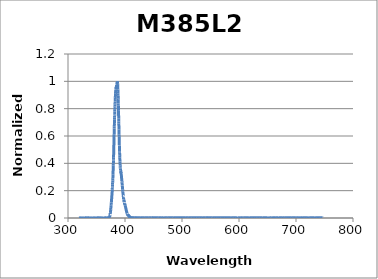
| Category | Normalized Intensity |
|---|---|
| 319.06123499 | 0 |
| 319.17558872 | 0 |
| 319.28993869 | 0 |
| 319.40428493 | 0.001 |
| 319.51862744 | 0 |
| 319.63296621 | 0 |
| 319.74730126 | 0 |
| 319.86163259 | 0 |
| 319.9759602 | 0 |
| 320.09028409 | 0 |
| 320.20460428 | 0 |
| 320.31892077 | 0 |
| 320.43323355 | 0 |
| 320.54754264 | 0 |
| 320.66184804 | 0 |
| 320.77614975 | 0 |
| 320.89044778 | 0 |
| 321.00474213 | 0 |
| 321.11903281 | 0 |
| 321.23331982 | 0 |
| 321.34760317 | 0 |
| 321.46188285 | 0.001 |
| 321.57615889 | 0 |
| 321.69043127 | 0 |
| 321.8047 | 0.001 |
| 321.91896509 | 0.001 |
| 322.03322655 | 0 |
| 322.14748437 | 0 |
| 322.26173856 | 0 |
| 322.37598913 | 0 |
| 322.49023607 | 0 |
| 322.60447941 | 0.001 |
| 322.71871913 | 0 |
| 322.83295524 | 0 |
| 322.94718775 | 0 |
| 323.06141667 | 0 |
| 323.17564199 | 0 |
| 323.28986372 | 0.001 |
| 323.40408187 | 0 |
| 323.51829644 | 0 |
| 323.63250743 | 0 |
| 323.74671485 | 0 |
| 323.8609187 | 0 |
| 323.97511899 | 0 |
| 324.08931573 | 0 |
| 324.20350891 | 0.001 |
| 324.31769854 | 0 |
| 324.43188462 | 0.001 |
| 324.54606717 | 0 |
| 324.66024618 | 0 |
| 324.77442166 | 0 |
| 324.88859361 | 0 |
| 325.00276204 | 0 |
| 325.11692695 | 0.001 |
| 325.23108834 | 0 |
| 325.34524623 | 0.001 |
| 325.45940061 | 0 |
| 325.5735515 | 0 |
| 325.68769888 | 0 |
| 325.80184278 | 0 |
| 325.91598318 | 0 |
| 326.03012011 | 0 |
| 326.14425355 | 0 |
| 326.25838353 | 0 |
| 326.37251003 | 0 |
| 326.48663307 | 0 |
| 326.60075264 | 0 |
| 326.71486877 | 0.001 |
| 326.82898144 | 0.001 |
| 326.94309066 | 0 |
| 327.05719644 | 0 |
| 327.17129878 | 0.001 |
| 327.28539768 | 0 |
| 327.39949316 | 0 |
| 327.51358521 | 0 |
| 327.62767384 | 0 |
| 327.74175906 | 0.001 |
| 327.85584086 | 0.001 |
| 327.96991926 | 0 |
| 328.08399425 | 0 |
| 328.19806584 | 0.001 |
| 328.31213404 | 0.001 |
| 328.42619885 | 0 |
| 328.54026028 | 0 |
| 328.65431832 | 0 |
| 328.76837299 | 0.001 |
| 328.88242428 | 0 |
| 328.99647221 | 0 |
| 329.11051677 | 0 |
| 329.22455798 | 0 |
| 329.33859583 | 0 |
| 329.45263033 | 0 |
| 329.56666148 | 0 |
| 329.6806893 | 0 |
| 329.79471377 | 0 |
| 329.90873492 | 0.001 |
| 330.02275274 | 0 |
| 330.13676723 | 0.001 |
| 330.2507784 | 0.001 |
| 330.36478626 | 0 |
| 330.47879081 | 0 |
| 330.59279206 | 0 |
| 330.70679 | 0 |
| 330.82078465 | 0 |
| 330.934776 | 0 |
| 331.04876407 | 0 |
| 331.16274885 | 0 |
| 331.27673036 | 0 |
| 331.39070858 | 0.001 |
| 331.50468354 | 0.001 |
| 331.61865523 | 0 |
| 331.73262367 | 0.001 |
| 331.84658884 | 0 |
| 331.96055076 | 0 |
| 332.07450943 | 0 |
| 332.18846486 | 0 |
| 332.30241705 | 0 |
| 332.41636601 | 0.001 |
| 332.53031174 | 0 |
| 332.64425423 | 0 |
| 332.75819351 | 0 |
| 332.87212957 | 0 |
| 332.98606242 | 0 |
| 333.09999206 | 0.001 |
| 333.21391849 | 0.001 |
| 333.32784173 | 0.001 |
| 333.44176177 | 0 |
| 333.55567862 | 0 |
| 333.66959229 | 0 |
| 333.78350277 | 0.001 |
| 333.89741007 | 0 |
| 334.0113142 | 0.001 |
| 334.12521517 | 0 |
| 334.23911297 | 0 |
| 334.35300761 | 0 |
| 334.46689909 | 0.001 |
| 334.58078743 | 0 |
| 334.69467261 | 0 |
| 334.80855466 | 0 |
| 334.92243357 | 0 |
| 335.03630934 | 0.001 |
| 335.15018199 | 0.002 |
| 335.26405151 | 0.001 |
| 335.37791791 | 0 |
| 335.4917812 | 0 |
| 335.60564138 | 0 |
| 335.71949845 | 0 |
| 335.83335241 | 0.001 |
| 335.94720328 | 0 |
| 336.06105106 | 0.002 |
| 336.17489575 | 0.001 |
| 336.28873735 | 0.001 |
| 336.40257588 | 0 |
| 336.51641132 | 0 |
| 336.6302437 | 0.001 |
| 336.74407301 | 0.001 |
| 336.85789926 | 0 |
| 336.97172245 | 0.001 |
| 337.08554259 | 0 |
| 337.19935967 | 0 |
| 337.31317372 | 0 |
| 337.42698472 | 0.001 |
| 337.54079269 | 0 |
| 337.65459762 | 0 |
| 337.76839953 | 0.001 |
| 337.88219842 | 0 |
| 337.99599429 | 0 |
| 338.10978714 | 0.001 |
| 338.22357699 | 0.001 |
| 338.33736383 | 0 |
| 338.45114767 | 0 |
| 338.56492852 | 0.001 |
| 338.67870637 | 0 |
| 338.79248124 | 0 |
| 338.90625312 | 0 |
| 339.02002203 | 0 |
| 339.13378796 | 0 |
| 339.24755093 | 0.001 |
| 339.36131093 | 0 |
| 339.47506796 | 0.001 |
| 339.58882205 | 0 |
| 339.70257318 | 0 |
| 339.81632136 | 0 |
| 339.9300666 | 0.001 |
| 340.0438089 | 0 |
| 340.15754827 | 0.001 |
| 340.27128471 | 0 |
| 340.38501822 | 0 |
| 340.49874882 | 0 |
| 340.61247649 | 0.001 |
| 340.72620126 | 0 |
| 340.83992312 | 0.001 |
| 340.95364207 | 0 |
| 341.06735813 | 0 |
| 341.18107129 | 0 |
| 341.29478156 | 0.001 |
| 341.40848895 | 0 |
| 341.52219346 | 0 |
| 341.63589509 | 0 |
| 341.74959385 | 0.001 |
| 341.86328974 | 0 |
| 341.97698277 | 0 |
| 342.09067293 | 0 |
| 342.20436025 | 0 |
| 342.31804472 | 0 |
| 342.43172634 | 0 |
| 342.54540511 | 0 |
| 342.65908106 | 0 |
| 342.77275417 | 0 |
| 342.88642445 | 0 |
| 343.00009191 | 0 |
| 343.11375655 | 0.001 |
| 343.22741838 | 0 |
| 343.34107739 | 0 |
| 343.45473361 | 0 |
| 343.56838701 | 0.001 |
| 343.68203763 | 0 |
| 343.79568545 | 0 |
| 343.90933048 | 0 |
| 344.02297273 | 0 |
| 344.1366122 | 0 |
| 344.2502489 | 0.001 |
| 344.36388283 | 0 |
| 344.47751399 | 0.001 |
| 344.59114238 | 0.001 |
| 344.70476803 | 0.001 |
| 344.81839092 | 0 |
| 344.93201106 | 0.001 |
| 345.04562846 | 0 |
| 345.15924312 | 0 |
| 345.27285504 | 0 |
| 345.38646424 | 0 |
| 345.5000707 | 0.001 |
| 345.61367445 | 0 |
| 345.72727548 | 0 |
| 345.8408738 | 0.001 |
| 345.95446941 | 0 |
| 346.06806231 | 0.001 |
| 346.18165252 | 0 |
| 346.29524003 | 0 |
| 346.40882485 | 0 |
| 346.52240699 | 0 |
| 346.63598644 | 0 |
| 346.74956322 | 0 |
| 346.86313732 | 0 |
| 346.97670876 | 0.001 |
| 347.09027753 | 0 |
| 347.20384364 | 0 |
| 347.31740709 | 0 |
| 347.4309679 | 0 |
| 347.54452606 | 0 |
| 347.65808158 | 0 |
| 347.77163446 | 0 |
| 347.88518471 | 0 |
| 347.99873233 | 0 |
| 348.11227732 | 0.001 |
| 348.2258197 | 0.001 |
| 348.33935946 | 0 |
| 348.45289661 | 0 |
| 348.56643115 | 0 |
| 348.67996309 | 0 |
| 348.79349244 | 0 |
| 348.90701919 | 0 |
| 349.02054335 | 0.001 |
| 349.13406493 | 0 |
| 349.24758393 | 0 |
| 349.36110035 | 0 |
| 349.4746142 | 0.001 |
| 349.58812549 | 0 |
| 349.70163421 | 0 |
| 349.81514038 | 0 |
| 349.92864399 | 0 |
| 350.04214506 | 0 |
| 350.15564358 | 0 |
| 350.26913955 | 0 |
| 350.382633 | 0.001 |
| 350.49612391 | 0 |
| 350.6096123 | 0 |
| 350.72309816 | 0 |
| 350.83658151 | 0.001 |
| 350.95006234 | 0 |
| 351.06354066 | 0 |
| 351.17701648 | 0 |
| 351.2904898 | 0.001 |
| 351.40396063 | 0.001 |
| 351.51742896 | 0 |
| 351.6308948 | 0 |
| 351.74435817 | 0 |
| 351.85781905 | 0 |
| 351.97127746 | 0 |
| 352.08473341 | 0 |
| 352.19818688 | 0 |
| 352.3116379 | 0 |
| 352.42508646 | 0 |
| 352.53853257 | 0.001 |
| 352.65197624 | 0.001 |
| 352.76541746 | 0 |
| 352.87885624 | 0 |
| 352.99229259 | 0.001 |
| 353.10572651 | 0.001 |
| 353.219158 | 0 |
| 353.33258707 | 0 |
| 353.44601373 | 0 |
| 353.55943798 | 0.001 |
| 353.67285982 | 0 |
| 353.78627925 | 0.001 |
| 353.89969629 | 0 |
| 354.01311094 | 0.001 |
| 354.12652319 | 0 |
| 354.23993306 | 0 |
| 354.35334055 | 0 |
| 354.46674566 | 0.001 |
| 354.58014841 | 0 |
| 354.69354878 | 0 |
| 354.80694679 | 0 |
| 354.92034244 | 0 |
| 355.03373574 | 0 |
| 355.14712669 | 0.001 |
| 355.26051529 | 0 |
| 355.37390156 | 0.001 |
| 355.48728548 | 0 |
| 355.60066708 | 0.001 |
| 355.71404635 | 0 |
| 355.82742329 | 0.001 |
| 355.94079791 | 0 |
| 356.05417023 | 0.001 |
| 356.16754023 | 0 |
| 356.28090792 | 0.001 |
| 356.39427332 | 0 |
| 356.50763642 | 0.001 |
| 356.62099722 | 0.001 |
| 356.73435574 | 0.001 |
| 356.84771198 | 0 |
| 356.96106594 | 0.002 |
| 357.07441762 | 0 |
| 357.18776703 | 0 |
| 357.30111418 | 0 |
| 357.41445906 | 0.001 |
| 357.52780169 | 0 |
| 357.64114207 | 0 |
| 357.7544802 | 0 |
| 357.86781609 | 0.001 |
| 357.98114973 | 0 |
| 358.09448114 | 0 |
| 358.20781033 | 0.001 |
| 358.32113728 | 0 |
| 358.43446202 | 0 |
| 358.54778454 | 0.001 |
| 358.66110484 | 0 |
| 358.77442294 | 0 |
| 358.88773884 | 0 |
| 359.00105253 | 0.001 |
| 359.11436403 | 0 |
| 359.22767334 | 0.001 |
| 359.34098047 | 0 |
| 359.45428541 | 0 |
| 359.56758818 | 0 |
| 359.68088877 | 0.001 |
| 359.79418719 | 0 |
| 359.90748346 | 0 |
| 360.02077756 | 0 |
| 360.13406951 | 0 |
| 360.2473593 | 0 |
| 360.36064695 | 0 |
| 360.47393246 | 0 |
| 360.58721584 | 0 |
| 360.70049708 | 0 |
| 360.81377619 | 0 |
| 360.92705317 | 0 |
| 361.04032804 | 0 |
| 361.1536008 | 0 |
| 361.26687144 | 0.001 |
| 361.38013997 | 0 |
| 361.49340641 | 0 |
| 361.60667075 | 0 |
| 361.71993299 | 0.001 |
| 361.83319314 | 0 |
| 361.94645122 | 0 |
| 362.05970721 | 0 |
| 362.17296113 | 0.001 |
| 362.28621297 | 0 |
| 362.39946275 | 0.001 |
| 362.51271047 | 0.001 |
| 362.62595613 | 0 |
| 362.73919974 | 0 |
| 362.85244129 | 0 |
| 362.96568081 | 0.001 |
| 363.07891828 | 0.001 |
| 363.19215372 | 0 |
| 363.30538713 | 0 |
| 363.41861851 | 0 |
| 363.53184787 | 0.001 |
| 363.64507521 | 0 |
| 363.75830054 | 0 |
| 363.87152386 | 0 |
| 363.98474518 | 0 |
| 364.09796449 | 0 |
| 364.21118182 | 0 |
| 364.32439714 | 0 |
| 364.43761049 | 0 |
| 364.55082185 | 0.001 |
| 364.66403123 | 0.001 |
| 364.77723864 | 0 |
| 364.89044408 | 0.001 |
| 365.00364755 | 0 |
| 365.11684907 | 0 |
| 365.23004863 | 0 |
| 365.34324624 | 0.002 |
| 365.4564419 | 0 |
| 365.56963562 | 0 |
| 365.6828274 | 0 |
| 365.79601725 | 0.001 |
| 365.90920516 | 0 |
| 366.02239116 | 0.001 |
| 366.13557523 | 0 |
| 366.24875739 | 0 |
| 366.36193764 | 0 |
| 366.47511598 | 0 |
| 366.58829241 | 0 |
| 366.70146695 | 0.001 |
| 366.8146396 | 0 |
| 366.92781035 | 0 |
| 367.04097922 | 0.001 |
| 367.15414621 | 0 |
| 367.26731133 | 0 |
| 367.38047457 | 0.001 |
| 367.49363594 | 0 |
| 367.60679546 | 0 |
| 367.71995311 | 0 |
| 367.83310891 | 0 |
| 367.94626286 | 0 |
| 368.05941497 | 0.001 |
| 368.17256523 | 0 |
| 368.28571366 | 0.001 |
| 368.39886026 | 0 |
| 368.51200503 | 0.001 |
| 368.62514798 | 0 |
| 368.73828911 | 0.001 |
| 368.85142842 | 0.001 |
| 368.96456593 | 0.002 |
| 369.07770163 | 0.001 |
| 369.19083553 | 0 |
| 369.30396763 | 0.001 |
| 369.41709794 | 0 |
| 369.53022646 | 0 |
| 369.6433532 | 0.001 |
| 369.75647817 | 0.001 |
| 369.86960135 | 0.001 |
| 369.98272277 | 0.001 |
| 370.09584242 | 0.001 |
| 370.20896031 | 0 |
| 370.32207645 | 0.002 |
| 370.43519083 | 0.001 |
| 370.54830347 | 0.002 |
| 370.66141436 | 0.002 |
| 370.77452351 | 0.002 |
| 370.88763093 | 0.002 |
| 371.00073662 | 0.001 |
| 371.11384058 | 0.002 |
| 371.22694283 | 0.002 |
| 371.34004335 | 0.002 |
| 371.45314216 | 0.003 |
| 371.56623927 | 0.002 |
| 371.67933467 | 0.003 |
| 371.79242838 | 0.003 |
| 371.90552038 | 0.004 |
| 372.0186107 | 0.004 |
| 372.13169934 | 0.004 |
| 372.24478629 | 0.005 |
| 372.35787156 | 0.006 |
| 372.47095516 | 0.007 |
| 372.5840371 | 0.007 |
| 372.69711737 | 0.008 |
| 372.81019598 | 0.009 |
| 372.92327294 | 0.008 |
| 373.03634824 | 0.012 |
| 373.14942191 | 0.011 |
| 373.26249392 | 0.014 |
| 373.37556431 | 0.014 |
| 373.48863306 | 0.018 |
| 373.60170018 | 0.02 |
| 373.71476568 | 0.021 |
| 373.82782956 | 0.024 |
| 373.94089182 | 0.029 |
| 374.05395247 | 0.029 |
| 374.16701152 | 0.036 |
| 374.28006897 | 0.038 |
| 374.39312481 | 0.041 |
| 374.50617907 | 0.043 |
| 374.61923174 | 0.05 |
| 374.73228282 | 0.053 |
| 374.84533233 | 0.056 |
| 374.95838025 | 0.062 |
| 375.07142661 | 0.065 |
| 375.18447141 | 0.074 |
| 375.29751464 | 0.078 |
| 375.41055631 | 0.084 |
| 375.52359643 | 0.093 |
| 375.636635 | 0.094 |
| 375.74967203 | 0.099 |
| 375.86270752 | 0.101 |
| 375.97574147 | 0.112 |
| 376.08877389 | 0.117 |
| 376.20180479 | 0.123 |
| 376.31483416 | 0.127 |
| 376.42786202 | 0.134 |
| 376.54088836 | 0.14 |
| 376.6539132 | 0.144 |
| 376.76693653 | 0.15 |
| 376.87995836 | 0.157 |
| 376.9929787 | 0.165 |
| 377.10599754 | 0.169 |
| 377.2190149 | 0.178 |
| 377.33203077 | 0.183 |
| 377.44504517 | 0.191 |
| 377.5580581 | 0.198 |
| 377.67106955 | 0.21 |
| 377.78407955 | 0.213 |
| 377.89708808 | 0.223 |
| 378.01009516 | 0.23 |
| 378.12310078 | 0.243 |
| 378.23610496 | 0.256 |
| 378.3491077 | 0.262 |
| 378.46210899 | 0.274 |
| 378.57510886 | 0.279 |
| 378.6881073 | 0.291 |
| 378.80110431 | 0.3 |
| 378.9140999 | 0.316 |
| 379.02709408 | 0.329 |
| 379.14008684 | 0.342 |
| 379.2530782 | 0.356 |
| 379.36606815 | 0.366 |
| 379.47905671 | 0.386 |
| 379.59204388 | 0.399 |
| 379.70502965 | 0.421 |
| 379.81801404 | 0.43 |
| 379.93099705 | 0.445 |
| 380.04397868 | 0.462 |
| 380.15695895 | 0.481 |
| 380.26993784 | 0.497 |
| 380.38291538 | 0.514 |
| 380.49589155 | 0.535 |
| 380.60886637 | 0.557 |
| 380.72183984 | 0.578 |
| 380.83481197 | 0.592 |
| 380.94778276 | 0.614 |
| 381.06075221 | 0.632 |
| 381.17372033 | 0.655 |
| 381.28668712 | 0.668 |
| 381.39965259 | 0.687 |
| 381.51261674 | 0.694 |
| 381.62557958 | 0.719 |
| 381.7385411 | 0.733 |
| 381.85150133 | 0.751 |
| 381.96446025 | 0.758 |
| 382.07741787 | 0.779 |
| 382.19037421 | 0.793 |
| 382.30332925 | 0.811 |
| 382.41628302 | 0.816 |
| 382.5292355 | 0.832 |
| 382.64218671 | 0.84 |
| 382.75513666 | 0.852 |
| 382.86808533 | 0.87 |
| 382.98103275 | 0.879 |
| 383.09397891 | 0.888 |
| 383.20692381 | 0.9 |
| 383.31986747 | 0.907 |
| 383.43280989 | 0.908 |
| 383.54575107 | 0.919 |
| 383.65869101 | 0.915 |
| 383.77162973 | 0.931 |
| 383.88456722 | 0.928 |
| 383.99750348 | 0.937 |
| 384.11043854 | 0.938 |
| 384.22337237 | 0.941 |
| 384.33630501 | 0.953 |
| 384.44923643 | 0.955 |
| 384.56216666 | 0.959 |
| 384.6750957 | 0.948 |
| 384.78802354 | 0.959 |
| 384.9009502 | 0.958 |
| 385.01387568 | 0.961 |
| 385.12679999 | 0.964 |
| 385.23972311 | 0.968 |
| 385.35264508 | 0.97 |
| 385.46556588 | 0.971 |
| 385.57848551 | 0.965 |
| 385.691404 | 0.975 |
| 385.80432133 | 0.976 |
| 385.91723752 | 0.977 |
| 386.03015257 | 0.983 |
| 386.14306648 | 0.989 |
| 386.25597926 | 0.988 |
| 386.36889091 | 0.995 |
| 386.48180144 | 0.992 |
| 386.59471085 | 0.998 |
| 386.70761914 | 1 |
| 386.82052633 | 0.988 |
| 386.9334324 | 0.986 |
| 387.04633738 | 0.985 |
| 387.15924126 | 0.978 |
| 387.27214404 | 0.971 |
| 387.38504574 | 0.966 |
| 387.49794636 | 0.944 |
| 387.61084589 | 0.94 |
| 387.72374435 | 0.928 |
| 387.83664174 | 0.909 |
| 387.94953807 | 0.894 |
| 388.06243333 | 0.873 |
| 388.17532753 | 0.864 |
| 388.28822068 | 0.838 |
| 388.40111279 | 0.821 |
| 388.51400385 | 0.805 |
| 388.62689387 | 0.784 |
| 388.73978286 | 0.762 |
| 388.85267081 | 0.745 |
| 388.96555774 | 0.729 |
| 389.07844365 | 0.706 |
| 389.19132854 | 0.692 |
| 389.30421241 | 0.666 |
| 389.41709528 | 0.648 |
| 389.52997715 | 0.628 |
| 389.64285801 | 0.609 |
| 389.75573788 | 0.598 |
| 389.86861676 | 0.57 |
| 389.98149465 | 0.556 |
| 390.09437156 | 0.532 |
| 390.2072475 | 0.528 |
| 390.32012246 | 0.505 |
| 390.43299645 | 0.488 |
| 390.54586948 | 0.478 |
| 390.65874154 | 0.46 |
| 390.77161265 | 0.454 |
| 390.88448282 | 0.441 |
| 390.99735203 | 0.43 |
| 391.1102203 | 0.421 |
| 391.22308764 | 0.414 |
| 391.33595404 | 0.4 |
| 391.44881951 | 0.392 |
| 391.56168406 | 0.382 |
| 391.67454769 | 0.38 |
| 391.7874104 | 0.37 |
| 391.9002722 | 0.362 |
| 392.0131331 | 0.359 |
| 392.12599309 | 0.36 |
| 392.23885219 | 0.35 |
| 392.35171039 | 0.35 |
| 392.4645677 | 0.346 |
| 392.57742413 | 0.344 |
| 392.69027968 | 0.337 |
| 392.80313435 | 0.332 |
| 392.91598815 | 0.338 |
| 393.02884109 | 0.33 |
| 393.14169316 | 0.325 |
| 393.25454437 | 0.32 |
| 393.36739473 | 0.32 |
| 393.48024425 | 0.318 |
| 393.59309291 | 0.313 |
| 393.70594074 | 0.307 |
| 393.81878773 | 0.305 |
| 393.93163389 | 0.298 |
| 394.04447922 | 0.291 |
| 394.15732373 | 0.287 |
| 394.27016742 | 0.283 |
| 394.3830103 | 0.279 |
| 394.49585237 | 0.274 |
| 394.60869363 | 0.265 |
| 394.7215341 | 0.262 |
| 394.83437376 | 0.255 |
| 394.94721264 | 0.251 |
| 395.06005073 | 0.245 |
| 395.17288803 | 0.237 |
| 395.28572456 | 0.236 |
| 395.39856031 | 0.23 |
| 395.5113953 | 0.223 |
| 395.62422952 | 0.218 |
| 395.73706297 | 0.212 |
| 395.84989568 | 0.209 |
| 395.96272763 | 0.198 |
| 396.07555883 | 0.196 |
| 396.18838929 | 0.19 |
| 396.30121901 | 0.188 |
| 396.414048 | 0.181 |
| 396.52687626 | 0.179 |
| 396.63970379 | 0.174 |
| 396.7525306 | 0.171 |
| 396.8653567 | 0.165 |
| 396.97818208 | 0.16 |
| 397.09100676 | 0.155 |
| 397.20383073 | 0.155 |
| 397.31665401 | 0.149 |
| 397.42947659 | 0.145 |
| 397.54229848 | 0.139 |
| 397.65511969 | 0.141 |
| 397.76794021 | 0.135 |
| 397.88076006 | 0.133 |
| 397.99357923 | 0.132 |
| 398.10639774 | 0.127 |
| 398.21921559 | 0.121 |
| 398.33203277 | 0.124 |
| 398.44484931 | 0.119 |
| 398.55766519 | 0.119 |
| 398.67048042 | 0.115 |
| 398.78329502 | 0.115 |
| 398.89610898 | 0.11 |
| 399.0089223 | 0.11 |
| 399.121735 | 0.106 |
| 399.23454708 | 0.107 |
| 399.34735853 | 0.105 |
| 399.46016938 | 0.107 |
| 399.57297961 | 0.102 |
| 399.68578923 | 0.102 |
| 399.79859826 | 0.099 |
| 399.91140669 | 0.097 |
| 400.02421452 | 0.097 |
| 400.13702177 | 0.095 |
| 400.24982843 | 0.09 |
| 400.36263452 | 0.09 |
| 400.47544003 | 0.089 |
| 400.58824497 | 0.089 |
| 400.70104934 | 0.085 |
| 400.81385315 | 0.083 |
| 400.92665641 | 0.081 |
| 401.03945911 | 0.08 |
| 401.15226127 | 0.075 |
| 401.26506288 | 0.074 |
| 401.37786395 | 0.071 |
| 401.49066449 | 0.069 |
| 401.60346449 | 0.067 |
| 401.71626397 | 0.067 |
| 401.82906293 | 0.064 |
| 401.94186137 | 0.063 |
| 402.0546593 | 0.059 |
| 402.16745672 | 0.057 |
| 402.28025364 | 0.056 |
| 402.39305006 | 0.053 |
| 402.50584598 | 0.053 |
| 402.61864141 | 0.05 |
| 402.73143636 | 0.046 |
| 402.84423082 | 0.047 |
| 402.95702481 | 0.044 |
| 403.06981832 | 0.044 |
| 403.18261137 | 0.041 |
| 403.29540395 | 0.04 |
| 403.40819607 | 0.036 |
| 403.52098774 | 0.037 |
| 403.63377895 | 0.034 |
| 403.74656972 | 0.032 |
| 403.85936005 | 0.031 |
| 403.97214994 | 0.031 |
| 404.0849394 | 0.029 |
| 404.19772842 | 0.028 |
| 404.31051703 | 0.028 |
| 404.42330521 | 0.026 |
| 404.53609298 | 0.025 |
| 404.64888034 | 0.024 |
| 404.76166729 | 0.023 |
| 404.87445384 | 0.025 |
| 404.98723999 | 0.02 |
| 405.10002575 | 0.021 |
| 405.21281112 | 0.02 |
| 405.3255961 | 0.021 |
| 405.43838071 | 0.021 |
| 405.55116494 | 0.019 |
| 405.6639488 | 0.019 |
| 405.77673229 | 0.018 |
| 405.88951542 | 0.014 |
| 406.00229819 | 0.016 |
| 406.11508061 | 0.018 |
| 406.22786268 | 0.016 |
| 406.34064441 | 0.017 |
| 406.45342579 | 0.018 |
| 406.56620684 | 0.014 |
| 406.67898756 | 0.015 |
| 406.79176795 | 0.013 |
| 406.90454802 | 0.014 |
| 407.01732777 | 0.011 |
| 407.13010721 | 0.013 |
| 407.24288633 | 0.011 |
| 407.35566516 | 0.013 |
| 407.46844368 | 0.009 |
| 407.58122191 | 0.012 |
| 407.69399984 | 0.01 |
| 407.80677749 | 0.01 |
| 407.91955486 | 0.008 |
| 408.03233195 | 0.009 |
| 408.14510876 | 0.008 |
| 408.25788531 | 0.008 |
| 408.37066159 | 0.005 |
| 408.48343761 | 0.008 |
| 408.59621337 | 0.005 |
| 408.70898888 | 0.007 |
| 408.82176415 | 0.005 |
| 408.93453917 | 0.007 |
| 409.04731396 | 0.003 |
| 409.16008851 | 0.005 |
| 409.27286283 | 0.003 |
| 409.38563692 | 0.005 |
| 409.4984108 | 0.003 |
| 409.61118446 | 0.005 |
| 409.7239579 | 0.002 |
| 409.83673114 | 0.005 |
| 409.94950418 | 0.001 |
| 410.06227702 | 0.004 |
| 410.17504966 | 0.001 |
| 410.28782212 | 0.004 |
| 410.40059439 | 0.002 |
| 410.51336648 | 0.003 |
| 410.62613839 | 0.001 |
| 410.73891013 | 0.003 |
| 410.85168171 | 0.001 |
| 410.96445312 | 0.003 |
| 411.07722437 | 0.001 |
| 411.18999546 | 0.003 |
| 411.30276641 | 0 |
| 411.41553721 | 0.002 |
| 411.52830788 | 0 |
| 411.6410784 | 0.002 |
| 411.75384879 | 0 |
| 411.86661906 | 0.002 |
| 411.9793892 | 0 |
| 412.09215922 | 0.002 |
| 412.20492913 | 0 |
| 412.31769893 | 0.003 |
| 412.43046862 | 0 |
| 412.54323822 | 0.002 |
| 412.65600771 | 0 |
| 412.76877711 | 0.002 |
| 412.88154643 | 0 |
| 412.99431566 | 0.002 |
| 413.10708482 | 0 |
| 413.21985389 | 0.002 |
| 413.3326229 | 0 |
| 413.44539184 | 0.001 |
| 413.55816073 | 0 |
| 413.67092955 | 0.003 |
| 413.78369832 | 0 |
| 413.89646705 | 0.002 |
| 414.00923573 | 0 |
| 414.12200437 | 0.003 |
| 414.23477298 | 0 |
| 414.34754155 | 0.001 |
| 414.4603101 | 0 |
| 414.57307863 | 0.001 |
| 414.68584715 | 0 |
| 414.79861565 | 0.002 |
| 414.91138414 | 0 |
| 415.02415263 | 0.002 |
| 415.13692111 | 0 |
| 415.24968961 | 0.001 |
| 415.36245811 | 0 |
| 415.47522663 | 0.001 |
| 415.58799516 | 0 |
| 415.70076372 | 0.001 |
| 415.81353231 | 0 |
| 415.92630093 | 0.001 |
| 416.03906958 | 0 |
| 416.15183828 | 0.001 |
| 416.26460701 | 0 |
| 416.3773758 | 0.001 |
| 416.49014465 | 0 |
| 416.60291355 | 0.001 |
| 416.71568251 | 0 |
| 416.82845154 | 0.002 |
| 416.94122064 | 0 |
| 417.05398982 | 0.002 |
| 417.16675908 | 0 |
| 417.27952842 | 0.001 |
| 417.39229785 | 0 |
| 417.50506738 | 0.002 |
| 417.617837 | 0 |
| 417.73060673 | 0 |
| 417.84337657 | 0 |
| 417.95614651 | 0.001 |
| 418.06891657 | 0 |
| 418.18168675 | 0.001 |
| 418.29445706 | 0 |
| 418.40722749 | 0.001 |
| 418.51999806 | 0 |
| 418.63276877 | 0.003 |
| 418.74553962 | 0 |
| 418.85831061 | 0.002 |
| 418.97108176 | 0 |
| 419.08385306 | 0.002 |
| 419.19662452 | 0 |
| 419.30939615 | 0.003 |
| 419.42216794 | 0 |
| 419.53493991 | 0.001 |
| 419.64771206 | 0 |
| 419.76048439 | 0.002 |
| 419.8732569 | 0 |
| 419.98602961 | 0.002 |
| 420.09880251 | 0 |
| 420.21157562 | 0.002 |
| 420.32434892 | 0 |
| 420.43712244 | 0 |
| 420.54989616 | 0 |
| 420.66267011 | 0 |
| 420.77544428 | 0 |
| 420.88821867 | 0.001 |
| 421.0009933 | 0 |
| 421.11376816 | 0.001 |
| 421.22654326 | 0 |
| 421.3393186 | 0.001 |
| 421.4520942 | 0 |
| 421.56487004 | 0.002 |
| 421.67764614 | 0 |
| 421.79042251 | 0.001 |
| 421.90319914 | 0 |
| 422.01597604 | 0.001 |
| 422.12875322 | 0 |
| 422.24153068 | 0.001 |
| 422.35430842 | 0 |
| 422.46708645 | 0.001 |
| 422.57986477 | 0 |
| 422.69264339 | 0.001 |
| 422.80542231 | 0 |
| 422.91820154 | 0.001 |
| 423.03098108 | 0 |
| 423.14376093 | 0.002 |
| 423.2565411 | 0 |
| 423.3693216 | 0.001 |
| 423.48210242 | 0 |
| 423.59488358 | 0.001 |
| 423.70766507 | 0 |
| 423.82044691 | 0.001 |
| 423.93322909 | 0 |
| 424.04601162 | 0 |
| 424.15879451 | 0 |
| 424.27157775 | 0.002 |
| 424.38436136 | 0 |
| 424.49714534 | 0.001 |
| 424.60992969 | 0 |
| 424.72271442 | 0 |
| 424.83549953 | 0 |
| 424.94828502 | 0 |
| 425.06107091 | 0 |
| 425.17385719 | 0.001 |
| 425.28664386 | 0 |
| 425.39943095 | 0.001 |
| 425.51221844 | 0 |
| 425.62500634 | 0.001 |
| 425.73779466 | 0 |
| 425.8505834 | 0.002 |
| 425.96337256 | 0 |
| 426.07616216 | 0 |
| 426.18895219 | 0 |
| 426.30174266 | 0.001 |
| 426.41453357 | 0 |
| 426.52732493 | 0.001 |
| 426.64011674 | 0 |
| 426.75290901 | 0.001 |
| 426.86570174 | 0 |
| 426.97849494 | 0.002 |
| 427.0912886 | 0 |
| 427.20408274 | 0.001 |
| 427.31687736 | 0 |
| 427.42967246 | 0.001 |
| 427.54246805 | 0 |
| 427.65526413 | 0.002 |
| 427.76806071 | 0 |
| 427.88085779 | 0.001 |
| 427.99365537 | 0 |
| 428.10645347 | 0.001 |
| 428.21925207 | 0 |
| 428.3320512 | 0.001 |
| 428.44485085 | 0 |
| 428.55765103 | 0.002 |
| 428.67045174 | 0 |
| 428.78325298 | 0.001 |
| 428.89605477 | 0 |
| 429.0088571 | 0.001 |
| 429.12165998 | 0 |
| 429.23446341 | 0.001 |
| 429.34726741 | 0 |
| 429.46007196 | 0.001 |
| 429.57287708 | 0 |
| 429.68568278 | 0.001 |
| 429.79848905 | 0 |
| 429.9112959 | 0.001 |
| 430.02410334 | 0 |
| 430.13691136 | 0.001 |
| 430.24971998 | 0 |
| 430.3625292 | 0.002 |
| 430.47533902 | 0 |
| 430.58814945 | 0.001 |
| 430.70096049 | 0 |
| 430.81377214 | 0.002 |
| 430.92658442 | 0 |
| 431.03939732 | 0.001 |
| 431.15221085 | 0 |
| 431.26502501 | 0.001 |
| 431.37783981 | 0 |
| 431.49065526 | 0.001 |
| 431.60347135 | 0 |
| 431.71628809 | 0.001 |
| 431.82910549 | 0 |
| 431.94192355 | 0.002 |
| 432.05474227 | 0 |
| 432.16756166 | 0.001 |
| 432.28038173 | 0 |
| 432.39320247 | 0.001 |
| 432.50602389 | 0 |
| 432.61884601 | 0.002 |
| 432.73166881 | 0 |
| 432.84449231 | 0.001 |
| 432.95731651 | 0 |
| 433.07014141 | 0.002 |
| 433.18296703 | 0 |
| 433.29579335 | 0.002 |
| 433.4086204 | 0 |
| 433.52144816 | 0.002 |
| 433.63427665 | 0 |
| 433.74710588 | 0.003 |
| 433.85993584 | 0 |
| 433.97276654 | 0.001 |
| 434.08559798 | 0 |
| 434.19843017 | 0.002 |
| 434.31126312 | 0 |
| 434.42409682 | 0.002 |
| 434.53693129 | 0 |
| 434.64976652 | 0.001 |
| 434.76260252 | 0 |
| 434.8754393 | 0.001 |
| 434.98827685 | 0 |
| 435.1011152 | 0.001 |
| 435.21395433 | 0 |
| 435.32679425 | 0.001 |
| 435.43963497 | 0 |
| 435.55247649 | 0.002 |
| 435.66531882 | 0 |
| 435.77816196 | 0.002 |
| 435.89100591 | 0 |
| 436.00385069 | 0.002 |
| 436.11669629 | 0 |
| 436.22954271 | 0.001 |
| 436.34238997 | 0 |
| 436.45523807 | 0.001 |
| 436.56808701 | 0 |
| 436.68093679 | 0 |
| 436.79378743 | 0 |
| 436.90663892 | 0.002 |
| 437.01949126 | 0 |
| 437.13234448 | 0.001 |
| 437.24519856 | 0 |
| 437.35805351 | 0.001 |
| 437.47090934 | 0 |
| 437.58376606 | 0.001 |
| 437.69662366 | 0 |
| 437.80948215 | 0.002 |
| 437.92234153 | 0 |
| 438.03520181 | 0.001 |
| 438.148063 | 0 |
| 438.26092509 | 0.001 |
| 438.3737881 | 0 |
| 438.48665203 | 0.001 |
| 438.59951687 | 0 |
| 438.71238264 | 0.001 |
| 438.82524934 | 0 |
| 438.93811698 | 0.002 |
| 439.05098556 | 0 |
| 439.16385508 | 0.002 |
| 439.27672554 | 0 |
| 439.38959696 | 0.002 |
| 439.50246934 | 0 |
| 439.61534268 | 0.001 |
| 439.72821698 | 0 |
| 439.84109225 | 0.001 |
| 439.9539685 | 0 |
| 440.06684572 | 0.001 |
| 440.17972393 | 0 |
| 440.29260313 | 0.001 |
| 440.40548332 | 0 |
| 440.51836451 | 0.002 |
| 440.6312467 | 0 |
| 440.74412989 | 0.002 |
| 440.85701409 | 0 |
| 440.96989931 | 0.002 |
| 441.08278554 | 0 |
| 441.1956728 | 0.001 |
| 441.30856109 | 0 |
| 441.42145041 | 0.001 |
| 441.53434076 | 0 |
| 441.64723216 | 0.001 |
| 441.7601246 | 0 |
| 441.87301809 | 0.001 |
| 441.98591264 | 0 |
| 442.09880824 | 0.001 |
| 442.21170491 | 0 |
| 442.32460264 | 0.001 |
| 442.43750145 | 0 |
| 442.55040133 | 0 |
| 442.66330229 | 0 |
| 442.77620434 | 0.001 |
| 442.88910748 | 0 |
| 443.00201171 | 0.001 |
| 443.11491704 | 0 |
| 443.22782347 | 0 |
| 443.34073101 | 0 |
| 443.45363966 | 0.001 |
| 443.56654943 | 0 |
| 443.67946032 | 0.001 |
| 443.79237233 | 0 |
| 443.90528548 | 0.002 |
| 444.01819975 | 0 |
| 444.13111517 | 0.003 |
| 444.24403173 | 0 |
| 444.35694943 | 0.001 |
| 444.46986829 | 0 |
| 444.5827883 | 0.001 |
| 444.69570947 | 0 |
| 444.80863181 | 0.001 |
| 444.92155532 | 0 |
| 445.03448 | 0.001 |
| 445.14740586 | 0 |
| 445.2603329 | 0.002 |
| 445.37326113 | 0 |
| 445.48619054 | 0.002 |
| 445.59912116 | 0 |
| 445.71205298 | 0.001 |
| 445.824986 | 0 |
| 445.93792022 | 0.001 |
| 446.05085567 | 0 |
| 446.16379233 | 0.001 |
| 446.27673021 | 0 |
| 446.38966932 | 0.002 |
| 446.50260966 | 0 |
| 446.61555124 | 0 |
| 446.72849405 | 0 |
| 446.84143812 | 0 |
| 446.95438343 | 0 |
| 447.06732999 | 0.002 |
| 447.18027781 | 0 |
| 447.29322689 | 0.002 |
| 447.40617724 | 0 |
| 447.51912886 | 0.002 |
| 447.63208176 | 0 |
| 447.74503594 | 0.002 |
| 447.8579914 | 0 |
| 447.97094815 | 0.003 |
| 448.08390619 | 0 |
| 448.19686553 | 0 |
| 448.30982617 | 0 |
| 448.42278812 | 0.001 |
| 448.53575138 | 0 |
| 448.64871596 | 0.001 |
| 448.76168185 | 0 |
| 448.87464907 | 0.001 |
| 448.98761762 | 0 |
| 449.1005875 | 0.001 |
| 449.21355871 | 0 |
| 449.32653127 | 0.001 |
| 449.43950518 | 0 |
| 449.55248044 | 0.002 |
| 449.66545705 | 0 |
| 449.77843502 | 0.001 |
| 449.89141436 | 0 |
| 450.00439506 | 0.001 |
| 450.11737714 | 0 |
| 450.23036059 | 0.002 |
| 450.34334543 | 0 |
| 450.45633165 | 0.001 |
| 450.56931926 | 0 |
| 450.68230827 | 0.001 |
| 450.79529867 | 0 |
| 450.90829048 | 0.002 |
| 451.0212837 | 0 |
| 451.13427833 | 0.001 |
| 451.24727438 | 0 |
| 451.36027185 | 0.001 |
| 451.47327075 | 0 |
| 451.58627108 | 0.001 |
| 451.69927284 | 0 |
| 451.81227604 | 0.002 |
| 451.92528068 | 0 |
| 452.03828677 | 0.001 |
| 452.15129432 | 0 |
| 452.26430332 | 0.002 |
| 452.37731378 | 0 |
| 452.49032571 | 0.001 |
| 452.60333911 | 0 |
| 452.71635398 | 0.001 |
| 452.82937034 | 0 |
| 452.94238817 | 0.001 |
| 453.0554075 | 0 |
| 453.16842832 | 0.001 |
| 453.28145063 | 0 |
| 453.39447444 | 0.001 |
| 453.50749976 | 0 |
| 453.62052659 | 0.001 |
| 453.73355494 | 0 |
| 453.8465848 | 0.002 |
| 453.95961619 | 0 |
| 454.0726491 | 0.002 |
| 454.18568355 | 0 |
| 454.29871953 | 0.001 |
| 454.41175706 | 0 |
| 454.52479613 | 0.001 |
| 454.63783675 | 0 |
| 454.75087892 | 0.001 |
| 454.86392266 | 0 |
| 454.97696795 | 0.001 |
| 455.09001482 | 0 |
| 455.20306325 | 0.002 |
| 455.31611327 | 0 |
| 455.42916486 | 0.001 |
| 455.54221804 | 0 |
| 455.65527281 | 0.002 |
| 455.76832917 | 0 |
| 455.88138713 | 0.001 |
| 455.99444669 | 0 |
| 456.10750787 | 0.001 |
| 456.22057065 | 0 |
| 456.33363505 | 0.002 |
| 456.44670107 | 0 |
| 456.55976871 | 0.001 |
| 456.67283799 | 0 |
| 456.7859089 | 0 |
| 456.89898145 | 0 |
| 457.01205564 | 0.002 |
| 457.12513147 | 0 |
| 457.23820896 | 0.001 |
| 457.35128811 | 0 |
| 457.46436892 | 0.002 |
| 457.57745139 | 0 |
| 457.69053553 | 0.001 |
| 457.80362134 | 0 |
| 457.91670883 | 0.001 |
| 458.02979801 | 0 |
| 458.14288887 | 0.002 |
| 458.25598142 | 0 |
| 458.36907567 | 0.002 |
| 458.48217162 | 0 |
| 458.59526928 | 0.001 |
| 458.70836864 | 0 |
| 458.82146972 | 0.001 |
| 458.93457252 | 0 |
| 459.04767704 | 0.002 |
| 459.16078328 | 0 |
| 459.27389126 | 0.001 |
| 459.38700097 | 0 |
| 459.50011242 | 0.001 |
| 459.61322562 | 0 |
| 459.72634057 | 0.001 |
| 459.83945727 | 0 |
| 459.95257573 | 0.001 |
| 460.06569595 | 0 |
| 460.17881793 | 0.002 |
| 460.29194169 | 0 |
| 460.40506723 | 0.001 |
| 460.51819454 | 0 |
| 460.63132364 | 0.001 |
| 460.74445453 | 0 |
| 460.85758721 | 0.001 |
| 460.97072169 | 0 |
| 461.08385797 | 0.001 |
| 461.19699605 | 0 |
| 461.31013595 | 0.002 |
| 461.42327767 | 0 |
| 461.5364212 | 0.001 |
| 461.64956656 | 0 |
| 461.76271375 | 0.002 |
| 461.87586277 | 0 |
| 461.98901362 | 0.002 |
| 462.10216632 | 0 |
| 462.21532087 | 0.002 |
| 462.32847727 | 0 |
| 462.44163552 | 0.001 |
| 462.55479563 | 0 |
| 462.66795761 | 0.001 |
| 462.78112145 | 0 |
| 462.89428717 | 0 |
| 463.00745477 | 0 |
| 463.12062424 | 0.001 |
| 463.23379561 | 0 |
| 463.34696886 | 0.002 |
| 463.46014401 | 0 |
| 463.57332106 | 0.002 |
| 463.68650001 | 0 |
| 463.79968087 | 0.002 |
| 463.91286365 | 0 |
| 464.02604834 | 0.001 |
| 464.13923495 | 0 |
| 464.25242349 | 0.001 |
| 464.36561396 | 0 |
| 464.47880637 | 0.001 |
| 464.59200071 | 0 |
| 464.705197 | 0.001 |
| 464.81839523 | 0 |
| 464.93159542 | 0.001 |
| 465.04479757 | 0 |
| 465.15800168 | 0.002 |
| 465.27120775 | 0 |
| 465.38441579 | 0.001 |
| 465.49762581 | 0 |
| 465.61083781 | 0 |
| 465.72405179 | 0 |
| 465.83726776 | 0.001 |
| 465.95048572 | 0 |
| 466.06370568 | 0.001 |
| 466.17692764 | 0 |
| 466.29015161 | 0.001 |
| 466.40337759 | 0 |
| 466.51660558 | 0.001 |
| 466.62983559 | 0 |
| 466.74306762 | 0.002 |
| 466.85630169 | 0 |
| 466.96953778 | 0.001 |
| 467.08277591 | 0 |
| 467.19601608 | 0 |
| 467.3092583 | 0 |
| 467.42250257 | 0.001 |
| 467.53574889 | 0 |
| 467.64899727 | 0.001 |
| 467.76224772 | 0 |
| 467.87550023 | 0.001 |
| 467.98875481 | 0 |
| 468.10201148 | 0.001 |
| 468.21527022 | 0 |
| 468.32853105 | 0.001 |
| 468.44179396 | 0 |
| 468.55505897 | 0.001 |
| 468.66832609 | 0 |
| 468.7815953 | 0.001 |
| 468.89486662 | 0 |
| 469.00814005 | 0.001 |
| 469.1214156 | 0 |
| 469.23469328 | 0.001 |
| 469.34797307 | 0 |
| 469.461255 | 0.001 |
| 469.57453906 | 0 |
| 469.68782526 | 0.001 |
| 469.8011136 | 0 |
| 469.91440409 | 0.002 |
| 470.02769673 | 0 |
| 470.14099153 | 0.001 |
| 470.25428848 | 0 |
| 470.36758761 | 0.002 |
| 470.4808889 | 0 |
| 470.59419237 | 0 |
| 470.70749801 | 0 |
| 470.82080584 | 0.002 |
| 470.93411585 | 0 |
| 471.04742806 | 0.001 |
| 471.16074246 | 0 |
| 471.27405907 | 0.001 |
| 471.38737788 | 0 |
| 471.50069889 | 0.002 |
| 471.61402213 | 0 |
| 471.72734758 | 0 |
| 471.84067525 | 0 |
| 471.95400515 | 0.002 |
| 472.06733728 | 0 |
| 472.18067165 | 0.001 |
| 472.29400826 | 0 |
| 472.40734711 | 0.001 |
| 472.52068821 | 0 |
| 472.63403157 | 0.002 |
| 472.74737718 | 0 |
| 472.86072506 | 0.001 |
| 472.9740752 | 0 |
| 473.08742761 | 0.001 |
| 473.2007823 | 0 |
| 473.31413927 | 0.001 |
| 473.42749853 | 0 |
| 473.54086007 | 0.002 |
| 473.65422391 | 0 |
| 473.76759005 | 0.001 |
| 473.88095849 | 0 |
| 473.99432923 | 0.001 |
| 474.10770229 | 0 |
| 474.22107766 | 0.001 |
| 474.33445535 | 0 |
| 474.44783537 | 0 |
| 474.56121771 | 0 |
| 474.67460239 | 0.001 |
| 474.78798941 | 0 |
| 474.90137876 | 0.001 |
| 475.01477047 | 0 |
| 475.12816453 | 0.001 |
| 475.24156094 | 0 |
| 475.35495971 | 0.002 |
| 475.46836085 | 0 |
| 475.58176435 | 0.002 |
| 475.69517023 | 0 |
| 475.80857848 | 0.002 |
| 475.92198912 | 0 |
| 476.03540214 | 0.001 |
| 476.14881756 | 0 |
| 476.26223537 | 0.001 |
| 476.37565558 | 0 |
| 476.48907819 | 0.001 |
| 476.60250322 | 0 |
| 476.71593065 | 0.001 |
| 476.8293605 | 0 |
| 476.94279278 | 0.001 |
| 477.05622748 | 0 |
| 477.16966461 | 0.002 |
| 477.28310418 | 0 |
| 477.39654619 | 0.001 |
| 477.50999064 | 0 |
| 477.62343753 | 0.001 |
| 477.73688689 | 0 |
| 477.8503387 | 0.001 |
| 477.96379297 | 0 |
| 478.0772497 | 0.001 |
| 478.19070891 | 0 |
| 478.30417059 | 0.002 |
| 478.41763476 | 0 |
| 478.5311014 | 0.001 |
| 478.64457054 | 0 |
| 478.75804216 | 0.001 |
| 478.87151629 | 0 |
| 478.98499291 | 0.002 |
| 479.09847204 | 0 |
| 479.21195368 | 0.001 |
| 479.32543784 | 0 |
| 479.43892452 | 0.001 |
| 479.55241372 | 0 |
| 479.66590544 | 0.002 |
| 479.7793997 | 0 |
| 479.8928965 | 0.002 |
| 480.00639584 | 0 |
| 480.11989772 | 0 |
| 480.23340216 | 0 |
| 480.34690915 | 0.001 |
| 480.4604187 | 0 |
| 480.57393081 | 0.001 |
| 480.68744549 | 0 |
| 480.80096274 | 0.001 |
| 480.91448257 | 0 |
| 481.02800498 | 0.001 |
| 481.14152997 | 0 |
| 481.25505756 | 0.001 |
| 481.36858774 | 0 |
| 481.48212052 | 0 |
| 481.5956559 | 0 |
| 481.70919389 | 0.001 |
| 481.82273449 | 0 |
| 481.93627771 | 0 |
| 482.04982355 | 0 |
| 482.16337202 | 0.001 |
| 482.27692311 | 0 |
| 482.39047684 | 0.001 |
| 482.50403321 | 0 |
| 482.61759222 | 0 |
| 482.73115388 | 0 |
| 482.84471819 | 0.001 |
| 482.95828516 | 0 |
| 483.07185479 | 0.001 |
| 483.18542708 | 0 |
| 483.29900205 | 0.002 |
| 483.41257969 | 0 |
| 483.52616 | 0.001 |
| 483.639743 | 0 |
| 483.75332869 | 0.001 |
| 483.86691707 | 0 |
| 483.98050814 | 0.002 |
| 484.09410192 | 0 |
| 484.2076984 | 0.001 |
| 484.32129759 | 0 |
| 484.43489949 | 0.001 |
| 484.54850412 | 0 |
| 484.66211146 | 0.001 |
| 484.77572154 | 0 |
| 484.88933434 | 0.002 |
| 485.00294988 | 0 |
| 485.11656816 | 0.001 |
| 485.23018919 | 0 |
| 485.34381296 | 0.002 |
| 485.45743949 | 0 |
| 485.57106878 | 0 |
| 485.68470083 | 0 |
| 485.79833565 | 0.001 |
| 485.91197324 | 0 |
| 486.02561361 | 0.001 |
| 486.13925675 | 0 |
| 486.25290268 | 0 |
| 486.3665514 | 0 |
| 486.48020291 | 0.002 |
| 486.59385723 | 0 |
| 486.70751434 | 0.001 |
| 486.82117426 | 0 |
| 486.93483699 | 0.001 |
| 487.04850254 | 0 |
| 487.16217091 | 0.001 |
| 487.2758421 | 0 |
| 487.38951613 | 0.001 |
| 487.50319298 | 0 |
| 487.61687267 | 0.001 |
| 487.73055521 | 0 |
| 487.84424059 | 0.001 |
| 487.95792883 | 0 |
| 488.07161992 | 0.001 |
| 488.18531387 | 0 |
| 488.29901068 | 0 |
| 488.41271036 | 0 |
| 488.52641292 | 0.002 |
| 488.64011835 | 0 |
| 488.75382667 | 0.002 |
| 488.86753787 | 0 |
| 488.98125197 | 0.002 |
| 489.09496896 | 0 |
| 489.20868885 | 0.001 |
| 489.32241164 | 0 |
| 489.43613734 | 0.001 |
| 489.54986596 | 0 |
| 489.66359749 | 0.002 |
| 489.77733195 | 0 |
| 489.89106933 | 0 |
| 490.00480964 | 0 |
| 490.11855289 | 0.001 |
| 490.23229908 | 0 |
| 490.34604821 | 0 |
| 490.45980029 | 0 |
| 490.57355532 | 0.002 |
| 490.68731331 | 0 |
| 490.80107427 | 0.001 |
| 490.91483818 | 0 |
| 491.02860507 | 0.002 |
| 491.14237494 | 0 |
| 491.25614778 | 0.002 |
| 491.36992361 | 0 |
| 491.48370243 | 0.001 |
| 491.59748423999997 | 0 |
| 491.71126905 | 0.001 |
| 491.82505685 | 0 |
| 491.93884767 | 0.001 |
| 492.05264149 | 0 |
| 492.16643834 | 0.001 |
| 492.28023819 | 0 |
| 492.39404108 | 0.001 |
| 492.50784699 | 0 |
| 492.62165594 | 0.001 |
| 492.73546792 | 0 |
| 492.84928294 | 0.002 |
| 492.96310101 | 0 |
| 493.07692213 | 0.002 |
| 493.1907463 | 0 |
| 493.30457354 | 0.002 |
| 493.41840383 | 0 |
| 493.5322372 | 0.001 |
| 493.64607364 | 0 |
| 493.75991315 | 0.002 |
| 493.87375575 | 0 |
| 493.98760143 | 0.001 |
| 494.1014502 | 0 |
| 494.21530207 | 0.001 |
| 494.32915704 | 0 |
| 494.44301511 | 0.001 |
| 494.55687628 | 0 |
| 494.67074057 | 0.002 |
| 494.78460798 | 0 |
| 494.89847851 | 0.002 |
| 495.01235216 | 0 |
| 495.12622895 | 0 |
| 495.24010886 | 0 |
| 495.35399192 | 0.001 |
| 495.46787812 | 0 |
| 495.58176747 | 0.001 |
| 495.69565997 | 0 |
| 495.80955563 | 0.001 |
| 495.92345444 | 0 |
| 496.03735643 | 0.001 |
| 496.15126158 | 0 |
| 496.26516991 | 0.002 |
| 496.37908142 | 0 |
| 496.49299611 | 0.002 |
| 496.60691398 | 0 |
| 496.72083505 | 0.002 |
| 496.83475932 | 0 |
| 496.94868678 | 0.002 |
| 497.06261746 | 0 |
| 497.17655134 | 0.002 |
| 497.29048843 | 0 |
| 497.40442875 | 0.002 |
| 497.51837229 | 0 |
| 497.63231905 | 0.001 |
| 497.74626905 | 0 |
| 497.86022228 | 0.002 |
| 497.97417875 | 0 |
| 498.08813847 | 0.002 |
| 498.20210144 | 0 |
| 498.31606766 | 0.001 |
| 498.43003714 | 0 |
| 498.54400989 | 0.001 |
| 498.6579859 | 0 |
| 498.77196518 | 0.001 |
| 498.88594774 | 0 |
| 498.99993358 | 0.002 |
| 499.11392271 | 0 |
| 499.22791512 | 0.001 |
| 499.34191083 | 0 |
| 499.45590983 | 0.001 |
| 499.56991214 | 0 |
| 499.68391776 | 0.001 |
| 499.79792668 | 0 |
| 499.91193893 | 0.002 |
| 500.02595449 | 0 |
| 500.13997338 | 0.002 |
| 500.2539956 | 0 |
| 500.36802115 | 0.001 |
| 500.48205004 | 0 |
| 500.59608227 | 0.002 |
| 500.71011785 | 0 |
| 500.82415678 | 0.001 |
| 500.93819907 | 0 |
| 501.05224471 | 0.002 |
| 501.16629372 | 0 |
| 501.2803461 | 0.002 |
| 501.39440186 | 0 |
| 501.50846099 | 0.002 |
| 501.6225235 | 0 |
| 501.7365894 | 0.002 |
| 501.8506587 | 0 |
| 501.96473138 | 0.001 |
| 502.07880747 | 0 |
| 502.19288696 | 0.003 |
| 502.30696986 | 0 |
| 502.42105618 | 0.002 |
| 502.53514591 | 0 |
| 502.64923906 | 0.001 |
| 502.76333565 | 0 |
| 502.87743566 | 0.001 |
| 502.99153911 | 0 |
| 503.10564599 | 0.001 |
| 503.21975632 | 0 |
| 503.3338701 | 0.001 |
| 503.44798734 | 0 |
| 503.56210803 | 0.001 |
| 503.67623218 | 0 |
| 503.7903598 | 0.001 |
| 503.90449089 | 0 |
| 504.01862546 | 0.001 |
| 504.13276351 | 0 |
| 504.24690504 | 0.002 |
| 504.36105005 | 0 |
| 504.47519857 | 0.001 |
| 504.58935057 | 0 |
| 504.70350609 | 0.001 |
| 504.8176651 | 0 |
| 504.93182763 | 0.001 |
| 505.04599367 | 0 |
| 505.16016324 | 0.001 |
| 505.27433632 | 0 |
| 505.38851294 | 0.001 |
| 505.50269309 | 0 |
| 505.61687677 | 0.002 |
| 505.731064 | 0 |
| 505.84525477 | 0.001 |
| 505.95944909 | 0 |
| 506.07364697 | 0.002 |
| 506.18784841 | 0 |
| 506.30205341 | 0.001 |
| 506.41626198 | 0 |
| 506.53047412 | 0.001 |
| 506.64468984 | 0 |
| 506.75890915 | 0.002 |
| 506.87313203 | 0 |
| 506.98735851 | 0.002 |
| 507.10158858 | 0 |
| 507.21582226 | 0.001 |
| 507.33005953 | 0 |
| 507.44430041 | 0.001 |
| 507.55854491 | 0 |
| 507.67279302 | 0.002 |
| 507.78704476 | 0 |
| 507.90130012 | 0.001 |
| 508.01555911 | 0 |
| 508.12982173 | 0.001 |
| 508.244088 | 0 |
| 508.35835791 | 0 |
| 508.47263146 | 0 |
| 508.58690867 | 0.001 |
| 508.70118953 | 0 |
| 508.81547406 | 0.001 |
| 508.92976225 | 0 |
| 509.04405411 | 0.001 |
| 509.15834965 | 0 |
| 509.27264886 | 0.001 |
| 509.38695176 | 0 |
| 509.50125835 | 0.001 |
| 509.61556863 | 0 |
| 509.7298826 | 0.002 |
| 509.84420028 | 0 |
| 509.95852166 | 0.002 |
| 510.07284675 | 0 |
| 510.18717556 | 0.001 |
| 510.30150808 | 0 |
| 510.41584433 | 0.001 |
| 510.53018431 | 0 |
| 510.64452801 | 0.001 |
| 510.75887546 | 0 |
| 510.87322664 | 0.001 |
| 510.98758157 | 0 |
| 511.10194025 | 0 |
| 511.21630269 | 0 |
| 511.33066888 | 0.001 |
| 511.44503883 | 0 |
| 511.55941256 | 0.001 |
| 511.67379005 | 0 |
| 511.78817132 | 0.001 |
| 511.90255638 | 0 |
| 512.01694521 | 0.001 |
| 512.13133784 | 0 |
| 512.24573426 | 0.002 |
| 512.36013448 | 0 |
| 512.4745385 | 0.002 |
| 512.58894633 | 0 |
| 512.70335797 | 0.002 |
| 512.81777343 | 0 |
| 512.93219271 | 0.002 |
| 513.04661581 | 0 |
| 513.16104274 | 0.002 |
| 513.27547351 | 0 |
| 513.38990811 | 0.002 |
| 513.50434656 | 0 |
| 513.61878885 | 0.002 |
| 513.733235 | 0 |
| 513.847685 | 0.002 |
| 513.96213886 | 0 |
| 514.07659659 | 0.001 |
| 514.19105818 | 0 |
| 514.30552365 | 0.002 |
| 514.419993 | 0 |
| 514.53446623 | 0.002 |
| 514.64894335 | 0 |
| 514.76342436 | 0.002 |
| 514.87790926 | 0 |
| 514.99239807 | 0.001 |
| 515.10689077 | 0 |
| 515.22138739 | 0.001 |
| 515.33588792 | 0 |
| 515.45039237 | 0.001 |
| 515.56490075 | 0 |
| 515.67941305 | 0.002 |
| 515.79392928 | 0 |
| 515.90844944 | 0.002 |
| 516.02297355 | 0 |
| 516.1375016 | 0.001 |
| 516.2520336 | 0 |
| 516.36656955 | 0.001 |
| 516.48110946 | 0 |
| 516.59565333 | 0.002 |
| 516.71020117 | 0 |
| 516.82475298 | 0.001 |
| 516.93930877 | 0 |
| 517.05386853 | 0.002 |
| 517.16843228 | 0 |
| 517.28300002 | 0.002 |
| 517.39757175 | 0 |
| 517.51214748 | 0.001 |
| 517.62672722 | 0 |
| 517.74131095 | 0.001 |
| 517.8558987 | 0 |
| 517.97049047 | 0.001 |
| 518.08508625 | 0 |
| 518.19968606 | 0.001 |
| 518.3142899 | 0 |
| 518.42889777 | 0.001 |
| 518.54350967 | 0 |
| 518.65812562 | 0.001 |
| 518.77274562 | 0 |
| 518.88736966 | 0.001 |
| 519.00199776 | 0 |
| 519.11662992 | 0.002 |
| 519.23126615 | 0 |
| 519.34590644 | 0.001 |
| 519.46055081 | 0 |
| 519.57519925 | 0.002 |
| 519.68985178 | 0 |
| 519.80450839 | 0.001 |
| 519.91916909 | 0 |
| 520.03383389 | 0.001 |
| 520.14850278 | 0 |
| 520.26317578 | 0.002 |
| 520.37785289 | 0 |
| 520.49253411 | 0.002 |
| 520.60721945 | 0 |
| 520.72190891 | 0.001 |
| 520.8366025 | 0 |
| 520.95130021 | 0.002 |
| 521.06600206 | 0 |
| 521.18070805 | 0 |
| 521.29541819 | 0 |
| 521.41013247 | 0.001 |
| 521.5248509 | 0 |
| 521.63957349 | 0.002 |
| 521.75430025 | 0 |
| 521.86903117 | 0.001 |
| 521.98376625 | 0 |
| 522.09850552 | 0.001 |
| 522.21324896 | 0 |
| 522.32799659 | 0.002 |
| 522.4427484 | 0 |
| 522.55750441 | 0.001 |
| 522.67226461 | 0 |
| 522.78702901 | 0.001 |
| 522.90179762 | 0 |
| 523.01657044 | 0.001 |
| 523.13134748 | 0 |
| 523.24612873 | 0.002 |
| 523.36091421 | 0 |
| 523.47570391 | 0.001 |
| 523.59049785 | 0 |
| 523.70529602 | 0.002 |
| 523.82009844 | 0 |
| 523.9349051 | 0.001 |
| 524.04971601 | 0 |
| 524.16453117 | 0.001 |
| 524.2793506 | 0 |
| 524.39417428 | 0.001 |
| 524.50900224 | 0 |
| 524.62383446 | 0 |
| 524.73867096 | 0 |
| 524.85351175 | 0.002 |
| 524.96835681 | 0 |
| 525.08320617 | 0.001 |
| 525.19805983 | 0 |
| 525.31291778 | 0 |
| 525.42778003 | 0 |
| 525.54264659 | 0.001 |
| 525.65751747 | 0 |
| 525.77239265 | 0.002 |
| 525.88727216 | 0 |
| 526.002156 | 0.001 |
| 526.11704417 | 0 |
| 526.23193666 | 0.001 |
| 526.3468335 | 0 |
| 526.46173468 | 0.001 |
| 526.57664021 | 0 |
| 526.69155009 | 0.001 |
| 526.80646432 | 0 |
| 526.92138292 | 0.002 |
| 527.03630588 | 0 |
| 527.15123321 | 0.001 |
| 527.26616492 | 0 |
| 527.381101 | 0.002 |
| 527.49604146 | 0 |
| 527.61098632 | 0.001 |
| 527.72593556 | 0 |
| 527.8408892 | 0.001 |
| 527.95584724 | 0 |
| 528.07080969 | 0.001 |
| 528.18577654 | 0 |
| 528.30074781 | 0.001 |
| 528.41572349 | 0 |
| 528.5307036 | 0.001 |
| 528.64568814 | 0 |
| 528.7606771 | 0.001 |
| 528.87567051 | 0 |
| 528.99066835 | 0.003 |
| 529.10567064 | 0 |
| 529.22067738 | 0.001 |
| 529.33568857 | 0 |
| 529.45070421 | 0.001 |
| 529.56572432 | 0 |
| 529.6807489 | 0.002 |
| 529.79577795 | 0 |
| 529.91081147 | 0.002 |
| 530.02584948 | 0 |
| 530.14089197 | 0 |
| 530.25593894 | 0 |
| 530.37099042 | 0.002 |
| 530.48604638 | 0 |
| 530.60110686 | 0.001 |
| 530.71617183 | 0 |
| 530.83124132 | 0.002 |
| 530.94631533 | 0 |
| 531.06139385 | 0.001 |
| 531.1764769 | 0 |
| 531.29156448 | 0.001 |
| 531.40665659 | 0 |
| 531.52175323 | 0.001 |
| 531.63685442 | 0 |
| 531.75196016 | 0.001 |
| 531.86707045 | 0 |
| 531.98218529 | 0 |
| 532.09730469 | 0 |
| 532.21242866 | 0.002 |
| 532.3275572 | 0 |
| 532.4426903 | 0.001 |
| 532.55782799 | 0 |
| 532.67297026 | 0.001 |
| 532.78811711 | 0 |
| 532.90326855 | 0.001 |
| 533.01842459 | 0 |
| 533.13358523 | 0.001 |
| 533.24875048 | 0 |
| 533.36392033 | 0 |
| 533.47909479 | 0 |
| 533.59427388 | 0.001 |
| 533.70945758 | 0 |
| 533.82464591 | 0.001 |
| 533.93983887 | 0 |
| 534.05503646 | 0.001 |
| 534.1702387 | 0 |
| 534.28544558 | 0 |
| 534.4006571 | 0 |
| 534.51587328 | 0.002 |
| 534.63109412 | 0 |
| 534.74631962 | 0.001 |
| 534.86154978 | 0 |
| 534.97678462 | 0.001 |
| 535.09202413 | 0 |
| 535.20726831 | 0.002 |
| 535.32251719 | 0 |
| 535.43777075 | 0.001 |
| 535.553029 | 0 |
| 535.66829195 | 0.001 |
| 535.7835596 | 0 |
| 535.89883196 | 0.001 |
| 536.01410903 | 0 |
| 536.12939081 | 0.002 |
| 536.24467731 | 0 |
| 536.35996853 | 0.001 |
| 536.47526449 | 0 |
| 536.59056517 | 0.001 |
| 536.70587059 | 0 |
| 536.82118075 | 0.001 |
| 536.93649566 | 0 |
| 537.05181532 | 0.001 |
| 537.16713973 | 0 |
| 537.28246891 | 0.001 |
| 537.39780284 | 0 |
| 537.51314155 | 0.001 |
| 537.62848502 | 0 |
| 537.74383327 | 0.001 |
| 537.85918631 | 0 |
| 537.97454412 | 0 |
| 538.08990673 | 0 |
| 538.20527413 | 0.001 |
| 538.32064634 | 0 |
| 538.43602334 | 0.002 |
| 538.55140515 | 0 |
| 538.66679178 | 0.002 |
| 538.78218322 | 0 |
| 538.89757948 | 0.002 |
| 539.01298057 | 0 |
| 539.12838648 | 0.001 |
| 539.24379723 | 0 |
| 539.35921282 | 0.002 |
| 539.47463326 | 0 |
| 539.59005854 | 0.001 |
| 539.70548867 | 0 |
| 539.82092366 | 0 |
| 539.93636351 | 0 |
| 540.05180822 | 0 |
| 540.1672578 | 0 |
| 540.28271226 | 0.001 |
| 540.3981716 | 0 |
| 540.51363582 | 0.002 |
| 540.62910492 | 0 |
| 540.74457892 | 0.001 |
| 540.86005781 | 0 |
| 540.97554161 | 0.002 |
| 541.09103031 | 0 |
| 541.20652392 | 0.001 |
| 541.32202244 | 0 |
| 541.43752588 | 0 |
| 541.55303424 | 0 |
| 541.66854753 | 0.002 |
| 541.78406576 | 0 |
| 541.89958892 | 0.001 |
| 542.01511701 | 0 |
| 542.13065006 | 0 |
| 542.24618805 | 0 |
| 542.361731 | 0.001 |
| 542.4772789 | 0 |
| 542.59283177 | 0.001 |
| 542.7083896 | 0 |
| 542.82395241 | 0 |
| 542.93952019 | 0 |
| 543.05509295 | 0.001 |
| 543.1706707 | 0 |
| 543.28625343 | 0.003 |
| 543.40184116 | 0 |
| 543.51743389 | 0.001 |
| 543.63303162 | 0 |
| 543.74863435 | 0.001 |
| 543.8642421 | 0 |
| 543.97985486 | 0.001 |
| 544.09547265 | 0 |
| 544.21109545 | 0.001 |
| 544.32672329 | 0 |
| 544.44235616 | 0.002 |
| 544.55799407 | 0 |
| 544.67363702 | 0.001 |
| 544.78928501 | 0 |
| 544.90493806 | 0 |
| 545.02059616 | 0 |
| 545.13625933 | 0 |
| 545.25192755 | 0 |
| 545.36760085 | 0.001 |
| 545.48327922 | 0 |
| 545.59896267 | 0.002 |
| 545.71465119 | 0 |
| 545.83034481 | 0.001 |
| 545.94604351 | 0 |
| 546.06174732 | 0 |
| 546.17745622 | 0 |
| 546.29317022 | 0 |
| 546.40888934 | 0 |
| 546.52461356 | 0.002 |
| 546.64034291 | 0 |
| 546.75607737 | 0.001 |
| 546.87181697 | 0 |
| 546.98756169 | 0.001 |
| 547.10331155 | 0 |
| 547.21906655 | 0.001 |
| 547.33482669 | 0 |
| 547.45059198 | 0.001 |
| 547.56636242 | 0 |
| 547.68213802 | 0.001 |
| 547.79791878 | 0 |
| 547.91370471 | 0.002 |
| 548.02949581 | 0 |
| 548.14529208 | 0.002 |
| 548.26109354 | 0 |
| 548.37690018 | 0.001 |
| 548.492712 | 0 |
| 548.60852902 | 0.002 |
| 548.72435123 | 0 |
| 548.84017865 | 0.001 |
| 548.95601127 | 0 |
| 549.07184911 | 0.001 |
| 549.18769215 | 0 |
| 549.30354042 | 0.001 |
| 549.41939391 | 0 |
| 549.53525263 | 0.002 |
| 549.65111658 | 0 |
| 549.76698577 | 0.001 |
| 549.8828602 | 0 |
| 549.99873988 | 0.002 |
| 550.1146248 | 0 |
| 550.23051498 | 0.001 |
| 550.34641042 | 0 |
| 550.46231113 | 0.002 |
| 550.5782171 | 0 |
| 550.69412834 | 0.001 |
| 550.81004486 | 0 |
| 550.92596666 | 0.002 |
| 551.04189375 | 0 |
| 551.15782613 | 0.001 |
| 551.2737638 | 0 |
| 551.38970677 | 0 |
| 551.50565504 | 0 |
| 551.62160863 | 0.002 |
| 551.73756752 | 0 |
| 551.85353173 | 0.001 |
| 551.96950126 | 0 |
| 552.08547612 | 0.002 |
| 552.20145631 | 0 |
| 552.31744183 | 0.002 |
| 552.43343269 | 0 |
| 552.54942889 | 0.001 |
| 552.66543044 | 0 |
| 552.78143735 | 0.001 |
| 552.8974496 | 0 |
| 553.01346723 | 0.001 |
| 553.12949021 | 0 |
| 553.24551857 | 0.001 |
| 553.3615523 | 0 |
| 553.4775914 | 0.002 |
| 553.5936359 | 0 |
| 553.70968577 | 0 |
| 553.82574104 | 0 |
| 553.94180171 | 0.001 |
| 554.05786778 | 0 |
| 554.17393925 | 0.001 |
| 554.29001613 | 0 |
| 554.40609843 | 0 |
| 554.52218615 | 0 |
| 554.63827928 | 0.002 |
| 554.75437785 | 0 |
| 554.87048184 | 0.001 |
| 554.98659128 | 0 |
| 555.10270615 | 0 |
| 555.21882647 | 0 |
| 555.33495224 | 0.001 |
| 555.45108346 | 0 |
| 555.56722014 | 0.002 |
| 555.68336228 | 0 |
| 555.79950989 | 0.002 |
| 555.91566297 | 0 |
| 556.03182153 | 0.001 |
| 556.14798557 | 0 |
| 556.26415509 | 0.001 |
| 556.3803301 | 0 |
| 556.49651061 | 0.002 |
| 556.61269661 | 0 |
| 556.72888811 | 0.001 |
| 556.84508513 | 0 |
| 556.96128765 | 0.002 |
| 557.07749569 | 0 |
| 557.19370925 | 0.002 |
| 557.30992834 | 0 |
| 557.42615295 | 0.002 |
| 557.5423831 | 0 |
| 557.65861878 | 0.001 |
| 557.77486001 | 0 |
| 557.89110679 | 0.001 |
| 558.00735911 | 0 |
| 558.12361699 | 0.001 |
| 558.23988044 | 0 |
| 558.35614944 | 0.001 |
| 558.47242402 | 0 |
| 558.58870417 | 0.002 |
| 558.70498989 | 0 |
| 558.8212812 | 0.001 |
| 558.9375781 | 0 |
| 559.05388058 | 0.001 |
| 559.17018866 | 0 |
| 559.28650234 | 0.001 |
| 559.40282163 | 0 |
| 559.51914653 | 0.001 |
| 559.63547703 | 0 |
| 559.75181316 | 0.001 |
| 559.86815491 | 0 |
| 559.98450228 | 0 |
| 560.10085528 | 0 |
| 560.21721392 | 0.002 |
| 560.3335782 | 0 |
| 560.44994813 | 0.001 |
| 560.5663237 | 0 |
| 560.68270493 | 0.002 |
| 560.79909181 | 0 |
| 560.91548435 | 0.001 |
| 561.03188257 | 0 |
| 561.14828645 | 0.001 |
| 561.26469601 | 0 |
| 561.38111124 | 0.001 |
| 561.49753216 | 0 |
| 561.61395877 | 0.001 |
| 561.73039107 | 0 |
| 561.84682907 | 0.001 |
| 561.96327277 | 0 |
| 562.07972218 | 0.002 |
| 562.1961773 | 0 |
| 562.31263813 | 0.002 |
| 562.42910468 | 0 |
| 562.54557696 | 0.001 |
| 562.66205496 | 0 |
| 562.7785387 | 0.001 |
| 562.89502818 | 0 |
| 563.01152339 | 0.001 |
| 563.12802435 | 0 |
| 563.24453106 | 0.002 |
| 563.36104353 | 0 |
| 563.47756176 | 0.002 |
| 563.59408575 | 0 |
| 563.71061551 | 0.001 |
| 563.82715104 | 0 |
| 563.94369234 | 0.001 |
| 564.06023943 | 0 |
| 564.17679231 | 0.001 |
| 564.29335097 | 0 |
| 564.40991543 | 0.001 |
| 564.52648569 | 0 |
| 564.64306175 | 0 |
| 564.75964362 | 0 |
| 564.8762313 | 0.001 |
| 564.9928248 | 0 |
| 565.10942412 | 0.002 |
| 565.22602927 | 0 |
| 565.34264025 | 0.002 |
| 565.45925706 | 0 |
| 565.57587971 | 0.002 |
| 565.6925082 | 0 |
| 565.80914254 | 0.001 |
| 565.92578273 | 0 |
| 566.04242878 | 0.001 |
| 566.15908069 | 0 |
| 566.27573847 | 0.002 |
| 566.39240211 | 0 |
| 566.50907163 | 0.002 |
| 566.62574703 | 0 |
| 566.74242832 | 0 |
| 566.85911549 | 0 |
| 566.97580855 | 0.002 |
| 567.09250751 | 0 |
| 567.20921237 | 0.002 |
| 567.32592313 | 0 |
| 567.4426398 | 0.001 |
| 567.55936239 | 0 |
| 567.6760909 | 0.002 |
| 567.79282533 | 0 |
| 567.90956569 | 0.002 |
| 568.02631198 | 0 |
| 568.1430642 | 0.001 |
| 568.25982237 | 0 |
| 568.37658648 | 0.001 |
| 568.49335654 | 0 |
| 568.61013256 | 0.002 |
| 568.72691453 | 0 |
| 568.84370247 | 0.001 |
| 568.96049637 | 0 |
| 569.07729625 | 0.001 |
| 569.1941021 | 0 |
| 569.31091393 | 0.001 |
| 569.42773175 | 0 |
| 569.54455555 | 0.001 |
| 569.66138536 | 0 |
| 569.77822115 | 0.001 |
| 569.89506296 | 0 |
| 570.01191076 | 0 |
| 570.12876458 | 0 |
| 570.24562442 | 0.001 |
| 570.36249028 | 0 |
| 570.47936216 | 0.002 |
| 570.59624007 | 0 |
| 570.71312401 | 0.001 |
| 570.830014 | 0 |
| 570.94691002 | 0.001 |
| 571.06381209 | 0 |
| 571.18072022 | 0.001 |
| 571.29763439 | 0 |
| 571.41455463 | 0.002 |
| 571.53148094 | 0 |
| 571.64841331 | 0.001 |
| 571.76535176 | 0 |
| 571.88229628 | 0.002 |
| 571.99924689 | 0 |
| 572.11620358 | 0.001 |
| 572.23316637 | 0 |
| 572.35013525 | 0.002 |
| 572.46711023 | 0 |
| 572.58409131 | 0.002 |
| 572.70107851 | 0 |
| 572.81807181 | 0.001 |
| 572.93507124 | 0 |
| 573.05207679 | 0.001 |
| 573.16908846 | 0 |
| 573.28610627 | 0.001 |
| 573.40313021 | 0 |
| 573.52016029 | 0.001 |
| 573.63719651 | 0 |
| 573.75423889 | 0.002 |
| 573.87128741 | 0 |
| 573.9883421 | 0.001 |
| 574.10540294 | 0 |
| 574.22246996 | 0.001 |
| 574.33954314 | 0 |
| 574.4566225 | 0 |
| 574.57370804 | 0 |
| 574.69079976 | 0.001 |
| 574.80789767 | 0 |
| 574.92500178 | 0.002 |
| 575.04211208 | 0 |
| 575.15922858 | 0.002 |
| 575.27635129 | 0 |
| 575.39348021 | 0.001 |
| 575.51061535 | 0 |
| 575.62775671 | 0.001 |
| 575.74490429 | 0 |
| 575.86205809 | 0.002 |
| 575.97921814 | 0 |
| 576.09638441 | 0.002 |
| 576.21355693 | 0 |
| 576.3307357 | 0.001 |
| 576.44792072 | 0 |
| 576.56511199 | 0.001 |
| 576.68230952 | 0 |
| 576.79951332 | 0.001 |
| 576.91672338 | 0 |
| 577.03393971 | 0.002 |
| 577.15116233 | 0 |
| 577.26839122 | 0.002 |
| 577.3856264 | 0 |
| 577.50286787 | 0.001 |
| 577.62011564 | 0 |
| 577.73736971 | 0.001 |
| 577.85463007 | 0 |
| 577.97189675 | 0.001 |
| 578.08916974 | 0 |
| 578.20644905 | 0.002 |
| 578.32373467 | 0 |
| 578.44102663 | 0.002 |
| 578.55832491 | 0 |
| 578.67562953 | 0.002 |
| 578.79294049 | 0 |
| 578.91025779 | 0.001 |
| 579.02758144 | 0 |
| 579.14491144 | 0.001 |
| 579.2622478 | 0 |
| 579.37959052 | 0.001 |
| 579.4969396 | 0 |
| 579.61429506 | 0.002 |
| 579.73165689 | 0 |
| 579.8490251 | 0.001 |
| 579.96639969 | 0 |
| 580.08378067 | 0.002 |
| 580.20116804 | 0 |
| 580.31856181 | 0.002 |
| 580.43596198 | 0 |
| 580.55336855 | 0.002 |
| 580.67078154 | 0 |
| 580.78820094 | 0.001 |
| 580.90562676 | 0 |
| 581.023059 | 0.002 |
| 581.14049767 | 0 |
| 581.25794277 | 0.002 |
| 581.3753943 | 0 |
| 581.49285228 | 0.001 |
| 581.61031671 | 0 |
| 581.72778758 | 0.001 |
| 581.84526491 | 0 |
| 581.96274869 | 0.001 |
| 582.08023894 | 0 |
| 582.19773566 | 0.002 |
| 582.31523885 | 0 |
| 582.43274851 | 0.001 |
| 582.55026466 | 0 |
| 582.66778729 | 0.001 |
| 582.78531641 | 0 |
| 582.90285202 | 0.002 |
| 583.02039414 | 0 |
| 583.13794275 | 0.002 |
| 583.25549788 | 0 |
| 583.37305951 | 0.001 |
| 583.49062766 | 0 |
| 583.60820233 | 0.001 |
| 583.72578353 | 0 |
| 583.84337125 | 0.001 |
| 583.96096551 | 0 |
| 584.07856631 | 0.001 |
| 584.19617365 | 0 |
| 584.31378754 | 0 |
| 584.43140798 | 0 |
| 584.54903497 | 0.001 |
| 584.66666853 | 0 |
| 584.78430865 | 0.001 |
| 584.90195534 | 0 |
| 585.0196086 | 0 |
| 585.13726845 | 0 |
| 585.25493487 | 0.001 |
| 585.37260788 | 0 |
| 585.49028748 | 0.001 |
| 585.60797368 | 0 |
| 585.72566648 | 0.001 |
| 585.84336588 | 0 |
| 585.96107189 | 0.001 |
| 586.07878452 | 0 |
| 586.19650376 | 0.002 |
| 586.31422963 | 0 |
| 586.43196212 | 0.001 |
| 586.54970125 | 0 |
| 586.66744701 | 0.002 |
| 586.78519941 | 0 |
| 586.90295845 | 0.001 |
| 587.02072414 | 0 |
| 587.13849649 | 0.002 |
| 587.25627549 | 0 |
| 587.37406116 | 0 |
| 587.49185349 | 0 |
| 587.6096525 | 0 |
| 587.72745818 | 0 |
| 587.84527054 | 0.001 |
| 587.96308958 | 0 |
| 588.08091531 | 0.001 |
| 588.19874774 | 0 |
| 588.31658686 | 0.001 |
| 588.43443269 | 0 |
| 588.55228522 | 0.001 |
| 588.67014447 | 0 |
| 588.78801042 | 0.002 |
| 588.9058831 | 0 |
| 589.0237625 | 0.001 |
| 589.14164863 | 0 |
| 589.2595415 | 0.001 |
| 589.3774411 | 0 |
| 589.49534744 | 0.001 |
| 589.61326053 | 0 |
| 589.73118037 | 0.001 |
| 589.84910697 | 0 |
| 589.96704032 | 0.001 |
| 590.08498044 | 0 |
| 590.20292733 | 0.001 |
| 590.32088099 | 0 |
| 590.43884143 | 0.002 |
| 590.55680865 | 0 |
| 590.67478265 | 0.001 |
| 590.79276345 | 0 |
| 590.91075104 | 0.001 |
| 591.02874543 | 0 |
| 591.14674662 | 0.001 |
| 591.26475463 | 0 |
| 591.38276944 | 0.002 |
| 591.50079107 | 0 |
| 591.61881953 | 0.002 |
| 591.73685481 | 0 |
| 591.85489692 | 0 |
| 591.97294586 | 0 |
| 592.09100165 | 0.001 |
| 592.20906427 | 0 |
| 592.32713375 | 0.001 |
| 592.44521008 | 0 |
| 592.56329327 | 0.002 |
| 592.68138331 | 0 |
| 592.79948023 | 0.001 |
| 592.91758401 | 0 |
| 593.03569467 | 0 |
| 593.1538122 | 0 |
| 593.27193662 | 0.001 |
| 593.39006793 | 0 |
| 593.50820613 | 0.002 |
| 593.62635123 | 0 |
| 593.74450323 | 0.001 |
| 593.86266213 | 0 |
| 593.98082795 | 0.001 |
| 594.09900068 | 0 |
| 594.21718032 | 0 |
| 594.3353669 | 0 |
| 594.45356039 | 0.002 |
| 594.57176083 | 0 |
| 594.68996819 | 0.001 |
| 594.8081825 | 0 |
| 594.92640376 | 0.001 |
| 595.04463196 | 0 |
| 595.16286712 | 0.001 |
| 595.28110924 | 0 |
| 595.39935832 | 0 |
| 595.51761437 | 0 |
| 595.63587739 | 0.001 |
| 595.75414738 | 0 |
| 595.87242436 | 0.001 |
| 595.99070832 | 0 |
| 596.10899928 | 0.002 |
| 596.22729722 | 0 |
| 596.34560217 | 0.001 |
| 596.46391412 | 0 |
| 596.58223307 | 0.001 |
| 596.70055904 | 0 |
| 596.81889202 | 0.001 |
| 596.93723203 | 0 |
| 597.05557906 | 0.001 |
| 597.17393312 | 0 |
| 597.29229421 | 0.001 |
| 597.41066235 | 0 |
| 597.52903752 | 0.001 |
| 597.64741974 | 0 |
| 597.76580902 | 0.001 |
| 597.88420535 | 0 |
| 598.00260874 | 0.001 |
| 598.12101919 | 0 |
| 598.23943672 | 0.001 |
| 598.35786132 | 0 |
| 598.47629299 | 0.001 |
| 598.59473175 | 0 |
| 598.7131776 | 0.001 |
| 598.83163054 | 0 |
| 598.95009057 | 0.001 |
| 599.06855771 | 0 |
| 599.18703195 | 0.001 |
| 599.3055133 | 0 |
| 599.42400176 | 0.001 |
| 599.54249734 | 0 |
| 599.66100004 | 0.002 |
| 599.77950987 | 0 |
| 599.89802684 | 0.001 |
| 600.01655093 | 0 |
| 600.13508217 | 0.002 |
| 600.25362055 | 0 |
| 600.37216609 | 0.001 |
| 600.49071877 | 0 |
| 600.60927861 | 0.001 |
| 600.72784562 | 0 |
| 600.84641979 | 0.001 |
| 600.96500113 | 0 |
| 601.08358965 | 0.001 |
| 601.20218535 | 0 |
| 601.32078824 | 0.001 |
| 601.43939831 | 0 |
| 601.55801558 | 0.002 |
| 601.67664004 | 0 |
| 601.7952717 | 0.001 |
| 601.91391058 | 0 |
| 602.03255666 | 0 |
| 602.15120996 | 0 |
| 602.26987048 | 0.002 |
| 602.38853822 | 0 |
| 602.50721319 | 0.001 |
| 602.6258954 | 0 |
| 602.74458484 | 0.001 |
| 602.86328153 | 0 |
| 602.98198546 | 0.002 |
| 603.10069664 | 0 |
| 603.21941508 | 0.001 |
| 603.33814078 | 0 |
| 603.45687374 | 0.001 |
| 603.57561397 | 0 |
| 603.69436147 | 0.001 |
| 603.81311625 | 0 |
| 603.93187831 | 0.001 |
| 604.05064766 | 0 |
| 604.1694243 | 0.001 |
| 604.28820824 | 0 |
| 604.40699947 | 0.002 |
| 604.52579801 | 0 |
| 604.64460386 | 0 |
| 604.76341702 | 0 |
| 604.88223749 | 0.001 |
| 605.00106529 | 0 |
| 605.11990042 | 0.001 |
| 605.23874287 | 0 |
| 605.35759266 | 0.001 |
| 605.47644979 | 0 |
| 605.59531427 | 0.001 |
| 605.71418609 | 0 |
| 605.83306526 | 0.002 |
| 605.95195179 | 0 |
| 606.07084569 | 0.001 |
| 606.18974695 | 0 |
| 606.30865558 | 0.001 |
| 606.42757158 | 0 |
| 606.54649497 | 0 |
| 606.66542573 | 0 |
| 606.78436389 | 0.001 |
| 606.90330944 | 0 |
| 607.02226238 | 0.001 |
| 607.14122273 | 0 |
| 607.26019048 | 0.001 |
| 607.37916564 | 0 |
| 607.49814822 | 0 |
| 607.61713822 | 0 |
| 607.73613564 | 0.001 |
| 607.85514048 | 0 |
| 607.97415276 | 0 |
| 608.09317248 | 0 |
| 608.21219964 | 0.001 |
| 608.33123424 | 0 |
| 608.4502763 | 0.001 |
| 608.56932581 | 0 |
| 608.68838277 | 0 |
| 608.8074472 | 0 |
| 608.9265191 | 0.001 |
| 609.04559847 | 0 |
| 609.16468532 | 0.002 |
| 609.28377965 | 0 |
| 609.40288146 | 0.002 |
| 609.52199077 | 0 |
| 609.64110756 | 0.002 |
| 609.76023186 | 0 |
| 609.87936366 | 0.001 |
| 609.99850297 | 0 |
| 610.11764979 | 0.002 |
| 610.23680412 | 0 |
| 610.35596598 | 0.001 |
| 610.47513536 | 0 |
| 610.59431228 | 0.001 |
| 610.71349672 | 0 |
| 610.83268871 | 0.001 |
| 610.95188824 | 0 |
| 611.07109531 | 0.002 |
| 611.19030994 | 0 |
| 611.30953212 | 0.001 |
| 611.42876187 | 0 |
| 611.54799918 | 0.001 |
| 611.66724405 | 0 |
| 611.78649651 | 0.002 |
| 611.90575654 | 0 |
| 612.02502415 | 0.001 |
| 612.14429936 | 0 |
| 612.26358215 | 0.001 |
| 612.38287254 | 0 |
| 612.50217053 | 0.001 |
| 612.62147612 | 0 |
| 612.74078933 | 0.001 |
| 612.86011015 | 0 |
| 612.97943858 | 0.002 |
| 613.09877464 | 0 |
| 613.21811833 | 0.001 |
| 613.33746965 | 0 |
| 613.4568286 | 0.001 |
| 613.5761952 | 0 |
| 613.69556943 | 0.002 |
| 613.81495132 | 0 |
| 613.93434087 | 0.002 |
| 614.05373807 | 0 |
| 614.17314293 | 0.001 |
| 614.29255546 | 0 |
| 614.41197566 | 0.001 |
| 614.53140354 | 0 |
| 614.65083909 | 0.001 |
| 614.77028234 | 0 |
| 614.88973327 | 0.001 |
| 615.00919189 | 0 |
| 615.12865821 | 0.001 |
| 615.24813224 | 0 |
| 615.36761397 | 0.001 |
| 615.48710341 | 0 |
| 615.60660057 | 0.002 |
| 615.72610545 | 0 |
| 615.84561805 | 0.001 |
| 615.96513839 | 0 |
| 616.08466645 | 0.002 |
| 616.20420226 | 0 |
| 616.3237458 | 0.001 |
| 616.44329709 | 0 |
| 616.56285614 | 0.001 |
| 616.68242293 | 0 |
| 616.80199749 | 0.001 |
| 616.92157982 | 0 |
| 617.04116991 | 0.002 |
| 617.16076777 | 0 |
| 617.28037341 | 0.001 |
| 617.39998684 | 0 |
| 617.51960805 | 0.001 |
| 617.63923705 | 0 |
| 617.75887385 | 0.001 |
| 617.87851845 | 0 |
| 617.99817085 | 0.001 |
| 618.11783106 | 0 |
| 618.23749908 | 0.001 |
| 618.35717492 | 0 |
| 618.47685858 | 0.001 |
| 618.59655007 | 0 |
| 618.71624939 | 0.001 |
| 618.83595654 | 0 |
| 618.95567154 | 0.001 |
| 619.07539438 | 0 |
| 619.19512506 | 0.001 |
| 619.3148636 | 0 |
| 619.43461 | 0.001 |
| 619.55436426 | 0 |
| 619.67412638 | 0.001 |
| 619.79389638 | 0 |
| 619.91367425 | 0.001 |
| 620.03346 | 0 |
| 620.15325363 | 0.001 |
| 620.27305515 | 0 |
| 620.39286456 | 0.001 |
| 620.51268188 | 0 |
| 620.63250709 | 0.001 |
| 620.75234021 | 0 |
| 620.87218124 | 0 |
| 620.99203018 | 0 |
| 621.11188704 | 0.002 |
| 621.23175183 | 0 |
| 621.35162455 | 0 |
| 621.47150519 | 0 |
| 621.59139378 | 0.001 |
| 621.7112903 | 0 |
| 621.83119478 | 0.002 |
| 621.9511072 | 0 |
| 622.07102758 | 0 |
| 622.19095591 | 0 |
| 622.31089221 | 0.002 |
| 622.43083648 | 0 |
| 622.55078872 | 0.001 |
| 622.67074893 | 0 |
| 622.79071713 | 0.001 |
| 622.91069332 | 0 |
| 623.03067749 | 0.001 |
| 623.15066966 | 0 |
| 623.27066982 | 0.001 |
| 623.39067799 | 0 |
| 623.51069417 | 0.001 |
| 623.63071836 | 0 |
| 623.75075057 | 0.001 |
| 623.8707908 | 0 |
| 623.99083905 | 0 |
| 624.11089533 | 0 |
| 624.23095965 | 0.002 |
| 624.35103201 | 0 |
| 624.47111241 | 0.001 |
| 624.59120086 | 0 |
| 624.71129736 | 0.001 |
| 624.83140191 | 0 |
| 624.95151453 | 0.001 |
| 625.07163521 | 0 |
| 625.19176396 | 0.002 |
| 625.31190079 | 0 |
| 625.43204569 | 0.002 |
| 625.55219868 | 0 |
| 625.67235976 | 0.001 |
| 625.79252892 | 0 |
| 625.91270619 | 0.002 |
| 626.03289155 | 0 |
| 626.15308502 | 0.001 |
| 626.2732866 | 0 |
| 626.39349629 | 0.002 |
| 626.5137141 | 0 |
| 626.63394004 | 0.002 |
| 626.7541741 | 0 |
| 626.87441629 | 0.001 |
| 626.99466662 | 0 |
| 627.11492509 | 0.002 |
| 627.2351917 | 0 |
| 627.35546647 | 0.001 |
| 627.47574939 | 0 |
| 627.59604046 | 0.001 |
| 627.7163397 | 0 |
| 627.83664711 | 0.002 |
| 627.95696269 | 0 |
| 628.07728644 | 0.002 |
| 628.19761837 | 0 |
| 628.31795849 | 0.002 |
| 628.4383068 | 0 |
| 628.5586633 | 0.002 |
| 628.679028 | 0 |
| 628.79940091 | 0.002 |
| 628.91978201 | 0 |
| 629.04017134 | 0.002 |
| 629.16056887 | 0 |
| 629.28097463 | 0.001 |
| 629.40138861 | 0 |
| 629.52181082 | 0.002 |
| 629.64224127 | 0 |
| 629.76267995 | 0.001 |
| 629.88312687 | 0 |
| 630.00358204 | 0.002 |
| 630.12404547 | 0 |
| 630.24451715 | 0.002 |
| 630.36499708 | 0 |
| 630.48548529 | 0.001 |
| 630.60598176 | 0 |
| 630.7264865 | 0.001 |
| 630.84699953 | 0 |
| 630.96752083 | 0.001 |
| 631.08805042 | 0 |
| 631.20858831 | 0.001 |
| 631.32913448 | 0 |
| 631.44968896 | 0.001 |
| 631.57025175 | 0 |
| 631.69082284 | 0.002 |
| 631.81140224 | 0 |
| 631.93198996 | 0.002 |
| 632.05258601 | 0 |
| 632.17319038 | 0.001 |
| 632.29380308 | 0 |
| 632.41442412 | 0.002 |
| 632.53505349 | 0 |
| 632.65569122 | 0.001 |
| 632.77633728 | 0 |
| 632.89699171 | 0.001 |
| 633.01765449 | 0 |
| 633.13832563 | 0.001 |
| 633.25900514 | 0 |
| 633.37969302 | 0 |
| 633.50038927 | 0 |
| 633.6210939 | 0 |
| 633.74180692 | 0 |
| 633.86252833 | 0.001 |
| 633.98325813 | 0 |
| 634.10399632 | 0.001 |
| 634.22474292 | 0 |
| 634.34549793 | 0 |
| 634.46626134 | 0 |
| 634.58703317 | 0.001 |
| 634.70781342 | 0 |
| 634.82860209 | 0.002 |
| 634.94939919 | 0 |
| 635.07020473 | 0.002 |
| 635.1910187 | 0 |
| 635.31184111 | 0.002 |
| 635.43267197 | 0 |
| 635.55351128 | 0.001 |
| 635.67435904 | 0 |
| 635.79521527 | 0.001 |
| 635.91607995 | 0 |
| 636.03695311 | 0.001 |
| 636.15783473 | 0 |
| 636.27872484 | 0.002 |
| 636.39962343 | 0 |
| 636.5205305 | 0.002 |
| 636.64144606 | 0 |
| 636.76237012 | 0.001 |
| 636.88330267 | 0 |
| 637.00424373 | 0.002 |
| 637.1251933 | 0 |
| 637.24615138 | 0.001 |
| 637.36711797 | 0 |
| 637.48809309 | 0.001 |
| 637.60907673 | 0 |
| 637.73006891 | 0.002 |
| 637.85106962 | 0 |
| 637.97207886 | 0.001 |
| 638.09309665 | 0 |
| 638.21412299 | 0.001 |
| 638.33515788 | 0 |
| 638.45620133 | 0.002 |
| 638.57725333 | 0 |
| 638.69831391 | 0.001 |
| 638.81938305 | 0 |
| 638.94046077 | 0.001 |
| 639.06154707 | 0 |
| 639.18264194 | 0.001 |
| 639.30374541 | 0 |
| 639.42485747 | 0.001 |
| 639.54597813 | 0 |
| 639.66710738 | 0.002 |
| 639.78824525 | 0 |
| 639.90939172 | 0.001 |
| 640.0305468 | 0 |
| 640.15171051 | 0.001 |
| 640.27288283 | 0 |
| 640.39406379 | 0.001 |
| 640.51525338 | 0 |
| 640.6364516 | 0.001 |
| 640.75765846 | 0 |
| 640.87887397 | 0 |
| 641.00009813 | 0 |
| 641.12133094 | 0.001 |
| 641.24257241 | 0 |
| 641.36382255 | 0.001 |
| 641.48508135 | 0 |
| 641.60634882 | 0.001 |
| 641.72762497 | 0 |
| 641.8489098 | 0.001 |
| 641.97020332 | 0 |
| 642.09150552 | 0.001 |
| 642.21281642 | 0 |
| 642.33413601 | 0.001 |
| 642.45546431 | 0 |
| 642.57680132 | 0.001 |
| 642.69814704 | 0 |
| 642.81950147 | 0.001 |
| 642.94086462 | 0 |
| 643.0622365 | 0.002 |
| 643.18361711 | 0 |
| 643.30500645 | 0.001 |
| 643.42640453 | 0 |
| 643.54781136 | 0.001 |
| 643.66922693 | 0 |
| 643.79065125 | 0 |
| 643.91208432 | 0 |
| 644.03352616 | 0.001 |
| 644.15497676 | 0 |
| 644.27643613 | 0.001 |
| 644.39790428 | 0 |
| 644.5193812 | 0.001 |
| 644.6408669 | 0 |
| 644.76236139 | 0.001 |
| 644.88386468 | 0 |
| 645.00537675 | 0.001 |
| 645.12689763 | 0 |
| 645.24842732 | 0 |
| 645.36996581 | 0 |
| 645.49151311 | 0.001 |
| 645.61306924 | 0 |
| 645.73463418 | 0.002 |
| 645.85620795 | 0 |
| 645.97779056 | 0.002 |
| 646.09938199 | 0 |
| 646.22098227 | 0.002 |
| 646.34259139 | 0 |
| 646.46420937 | 0.002 |
| 646.58583619 | 0 |
| 646.70747187 | 0.001 |
| 646.82911642 | 0 |
| 646.95076983 | 0.001 |
| 647.07243211 | 0 |
| 647.19410327 | 0.002 |
| 647.3157833 | 0 |
| 647.43747222 | 0.001 |
| 647.55917003 | 0 |
| 647.68087674 | 0.001 |
| 647.80259233 | 0 |
| 647.92431684 | 0.002 |
| 648.04605024 | 0 |
| 648.16779256 | 0.001 |
| 648.2895438 | 0 |
| 648.41130395 | 0.001 |
| 648.53307303 | 0 |
| 648.65485104 | 0.001 |
| 648.77663797 | 0 |
| 648.89843385 | 0.002 |
| 649.02023867 | 0 |
| 649.14205243 | 0.001 |
| 649.26387515 | 0 |
| 649.38570682 | 0.001 |
| 649.50754745 | 0 |
| 649.62939704 | 0.001 |
| 649.7512556 | 0 |
| 649.87312313 | 0.001 |
| 649.99499965 | 0 |
| 650.11688514 | 0.001 |
| 650.23877962 | 0 |
| 650.36068309 | 0.001 |
| 650.48259555 | 0 |
| 650.60451701 | 0 |
| 650.72644748 | 0 |
| 650.84838695 | 0 |
| 650.97033544 | 0 |
| 651.09229295 | 0.001 |
| 651.21425947 | 0 |
| 651.33623502 | 0 |
| 651.45821961 | 0 |
| 651.58021322 | 0.001 |
| 651.70221588 | 0 |
| 651.82422758 | 0.001 |
| 651.94624832 | 0 |
| 652.06827812 | 0.001 |
| 652.19031698 | 0 |
| 652.3123649 | 0.001 |
| 652.43442188 | 0 |
| 652.55648793 | 0.001 |
| 652.67856306 | 0 |
| 652.80064727 | 0.002 |
| 652.92274056 | 0 |
| 653.04484294 | 0.001 |
| 653.16695441 | 0 |
| 653.28907497 | 0.001 |
| 653.41120464 | 0 |
| 653.53334341 | 0.001 |
| 653.6554913 | 0 |
| 653.7776483 | 0.001 |
| 653.89981441 | 0 |
| 654.02198965 | 0.001 |
| 654.14417402 | 0 |
| 654.26636752 | 0.001 |
| 654.38857015 | 0 |
| 654.51078193 | 0.001 |
| 654.63300285 | 0 |
| 654.75523292 | 0.001 |
| 654.87747215 | 0 |
| 654.99972053 | 0.001 |
| 655.12197808 | 0 |
| 655.2442448 | 0.001 |
| 655.36652068 | 0 |
| 655.48880575 | 0 |
| 655.61109999 | 0 |
| 655.73340342 | 0.001 |
| 655.85571604 | 0 |
| 655.97803785 | 0.001 |
| 656.10036886 | 0 |
| 656.22270908 | 0 |
| 656.3450585 | 0 |
| 656.46741713 | 0.001 |
| 656.58978498 | 0 |
| 656.71216205 | 0.001 |
| 656.83454834 | 0 |
| 656.95694387 | 0.001 |
| 657.07934863 | 0 |
| 657.20176262 | 0 |
| 657.32418586 | 0 |
| 657.44661835 | 0.001 |
| 657.56906009 | 0 |
| 657.69151108 | 0.002 |
| 657.81397133 | 0 |
| 657.93644085 | 0.001 |
| 658.05891964 | 0 |
| 658.1814077 | 0.002 |
| 658.30390504 | 0 |
| 658.42641166 | 0 |
| 658.54892757 | 0 |
| 658.67145277 | 0.001 |
| 658.79398727 | 0 |
| 658.91653107 | 0.001 |
| 659.03908417 | 0 |
| 659.16164658 | 0.001 |
| 659.28421831 | 0 |
| 659.40679935 | 0.001 |
| 659.52938971 | 0 |
| 659.6519894 | 0.002 |
| 659.77459843 | 0 |
| 659.89721678 | 0.001 |
| 660.01984448 | 0 |
| 660.14248153 | 0.002 |
| 660.26512792 | 0 |
| 660.38778366 | 0.001 |
| 660.51044877 | 0 |
| 660.63312323 | 0 |
| 660.75580706 | 0 |
| 660.87850027 | 0.001 |
| 661.00120284 | 0 |
| 661.1239148 | 0.001 |
| 661.24663614 | 0 |
| 661.36936688 | 0.001 |
| 661.492107 | 0 |
| 661.61485652 | 0.001 |
| 661.73761545 | 0 |
| 661.86038378 | 0.001 |
| 661.98316152 | 0 |
| 662.10594868 | 0.002 |
| 662.22874525 | 0 |
| 662.35155125 | 0.001 |
| 662.47436668 | 0 |
| 662.59719155 | 0.001 |
| 662.72002585 | 0 |
| 662.84286959 | 0 |
| 662.96572278 | 0 |
| 663.08858542 | 0.001 |
| 663.21145751 | 0 |
| 663.33433906 | 0.001 |
| 663.45723008 | 0 |
| 663.58013057 | 0.002 |
| 663.70304053 | 0 |
| 663.82595996 | 0.001 |
| 663.94888888 | 0 |
| 664.07182729 | 0.002 |
| 664.19477518 | 0 |
| 664.31773257 | 0.002 |
| 664.44069946 | 0 |
| 664.56367585 | 0.001 |
| 664.68666175 | 0 |
| 664.80965717 | 0.001 |
| 664.9326621 | 0 |
| 665.05567655 | 0.002 |
| 665.17870053 | 0 |
| 665.30173404 | 0.002 |
| 665.42477708 | 0 |
| 665.54782967 | 0.002 |
| 665.67089179 | 0 |
| 665.79396347 | 0.001 |
| 665.9170447 | 0 |
| 666.04013548 | 0 |
| 666.16323583 | 0 |
| 666.28634574 | 0.001 |
| 666.40946522 | 0 |
| 666.53259428 | 0.003 |
| 666.65573291 | 0 |
| 666.77888113 | 0 |
| 666.90203894 | 0 |
| 667.02520634 | 0.001 |
| 667.14838334 | 0 |
| 667.27156994 | 0.002 |
| 667.39476614 | 0 |
| 667.51797195 | 0.001 |
| 667.64118738 | 0 |
| 667.76441243 | 0.002 |
| 667.8876471 | 0 |
| 668.0108914 | 0.002 |
| 668.13414533 | 0 |
| 668.25740889 | 0.001 |
| 668.3806821 | 0 |
| 668.50396495 | 0 |
| 668.62725746 | 0 |
| 668.75055962 | 0.001 |
| 668.87387143 | 0 |
| 668.99719291 | 0.001 |
| 669.12052406 | 0 |
| 669.24386488 | 0.001 |
| 669.36721537 | 0 |
| 669.49057555 | 0.001 |
| 669.61394541 | 0 |
| 669.73732497 | 0.001 |
| 669.86071421 | 0 |
| 669.98411316 | 0.001 |
| 670.1075218 | 0 |
| 670.23094016 | 0.001 |
| 670.35436823 | 0 |
| 670.47780601 | 0.001 |
| 670.60125351 | 0 |
| 670.72471074 | 0.001 |
| 670.8481777 | 0 |
| 670.97165439 | 0.001 |
| 671.09514083 | 0 |
| 671.218637 | 0.001 |
| 671.34214292 | 0 |
| 671.46565859 | 0.002 |
| 671.58918402 | 0 |
| 671.71271921 | 0.001 |
| 671.83626417 | 0 |
| 671.95981889 | 0.001 |
| 672.08338339 | 0 |
| 672.20695767 | 0.001 |
| 672.33054173 | 0 |
| 672.45413557 | 0.002 |
| 672.57773921 | 0 |
| 672.70135265 | 0.001 |
| 672.82497588 | 0 |
| 672.94860892 | 0.002 |
| 673.07225177 | 0 |
| 673.19590443 | 0.001 |
| 673.31956691 | 0 |
| 673.44323921 | 0.001 |
| 673.56692134 | 0 |
| 673.6906133 | 0.001 |
| 673.8143151 | 0 |
| 673.93802674 | 0.002 |
| 674.06174822 | 0 |
| 674.18547955 | 0 |
| 674.30922074 | 0 |
| 674.43297178 | 0.002 |
| 674.55673268 | 0 |
| 674.68050345 | 0.001 |
| 674.8042841 | 0 |
| 674.92807462 | 0.001 |
| 675.05187501 | 0 |
| 675.1756853 | 0.001 |
| 675.29950547 | 0 |
| 675.42333554 | 0.002 |
| 675.5471755 | 0 |
| 675.67102536 | 0.001 |
| 675.79488514 | 0 |
| 675.91875482 | 0.002 |
| 676.04263442 | 0 |
| 676.16652394 | 0 |
| 676.29042338 | 0 |
| 676.41433275 | 0.001 |
| 676.53825206 | 0 |
| 676.6621813 | 0.002 |
| 676.78612048 | 0 |
| 676.91006961 | 0.001 |
| 677.0340287 | 0 |
| 677.15799773 | 0 |
| 677.28197673 | 0 |
| 677.40596569 | 0.001 |
| 677.52996462 | 0 |
| 677.65397353 | 0.001 |
| 677.77799241 | 0 |
| 677.90202127 | 0.002 |
| 678.02606012 | 0 |
| 678.15010896 | 0.002 |
| 678.27416779 | 0 |
| 678.39823662 | 0.001 |
| 678.52231546 | 0 |
| 678.64640431 | 0.002 |
| 678.77050317 | 0 |
| 678.89461204 | 0.001 |
| 679.01873094 | 0 |
| 679.14285987 | 0.002 |
| 679.26699882 | 0 |
| 679.39114781 | 0.001 |
| 679.51530684 | 0 |
| 679.63947592 | 0.001 |
| 679.76365504 | 0 |
| 679.88784421 | 0.002 |
| 680.01204344 | 0 |
| 680.13625274 | 0.001 |
| 680.2604721 | 0 |
| 680.38470153 | 0.002 |
| 680.50894103 | 0 |
| 680.63319061 | 0.001 |
| 680.75745028 | 0 |
| 680.88172004 | 0.001 |
| 681.00599988 | 0 |
| 681.13028983 | 0.001 |
| 681.25458988 | 0 |
| 681.37890003 | 0.001 |
| 681.50322029 | 0 |
| 681.62755067 | 0.001 |
| 681.75189116 | 0 |
| 681.87624178 | 0.001 |
| 682.00060253 | 0 |
| 682.12497341 | 0.001 |
| 682.24935443 | 0 |
| 682.37374559 | 0.002 |
| 682.49814689 | 0 |
| 682.62255834 | 0.001 |
| 682.74697995 | 0 |
| 682.87141172 | 0.002 |
| 682.99585365 | 0 |
| 683.1203057499999 | 0.001 |
| 683.24476802 | 0 |
| 683.36924047 | 0.001 |
| 683.4937231 | 0 |
| 683.61821591 | 0.001 |
| 683.74271891 | 0 |
| 683.86723211 | 0.001 |
| 683.99175551 | 0 |
| 684.11628911 | 0.002 |
| 684.24083292 | 0 |
| 684.36538694 | 0.001 |
| 684.48995117 | 0 |
| 684.61452563 | 0 |
| 684.73911031 | 0 |
| 684.86370522 | 0.003 |
| 684.98831037 | 0 |
| 685.11292576 | 0 |
| 685.23755138 | 0 |
| 685.36218726 | 0.001 |
| 685.48683339 | 0 |
| 685.61148977 | 0.002 |
| 685.73615642 | 0 |
| 685.86083333 | 0.003 |
| 685.9855205 | 0 |
| 686.11021796 | 0.001 |
| 686.23492569 | 0 |
| 686.3596437 | 0.002 |
| 686.48437201 | 0 |
| 686.6091106 | 0.002 |
| 686.73385949 | 0 |
| 686.85861868 | 0.002 |
| 686.98338818 | 0 |
| 687.10816798 | 0.001 |
| 687.2329581 | 0 |
| 687.35775854 | 0.002 |
| 687.4825693 | 0 |
| 687.60739038 | 0.003 |
| 687.7322218 | 0 |
| 687.85706355 | 0.001 |
| 687.98191565 | 0 |
| 688.10677809 | 0.002 |
| 688.23165088 | 0 |
| 688.35653402 | 0 |
| 688.48142752 | 0 |
| 688.60633138 | 0.001 |
| 688.73124562 | 0 |
| 688.85617022 | 0.001 |
| 688.98110519 | 0 |
| 689.10605055 | 0.001 |
| 689.23100629 | 0 |
| 689.35597243 | 0.002 |
| 689.48094895 | 0 |
| 689.60593587 | 0.001 |
| 689.7309332 | 0 |
| 689.85594093 | 0.001 |
| 689.98095907 | 0 |
| 690.10598763 | 0.002 |
| 690.23102661 | 0 |
| 690.35607602 | 0.001 |
| 690.48113585 | 0 |
| 690.60620611 | 0.002 |
| 690.73128682 | 0 |
| 690.85637796 | 0 |
| 690.98147956 | 0 |
| 691.1065916 | 0.001 |
| 691.2317141 | 0 |
| 691.35684706 | 0.002 |
| 691.48199048 | 0 |
| 691.60714437 | 0.002 |
| 691.73230874 | 0 |
| 691.85748358 | 0.002 |
| 691.98266891 | 0 |
| 692.10786472 | 0.002 |
| 692.23307102 | 0 |
| 692.35828782 | 0.001 |
| 692.48351512 | 0 |
| 692.60875292 | 0.002 |
| 692.73400123 | 0 |
| 692.85926005 | 0.002 |
| 692.98452939 | 0 |
| 693.10980926 | 0.001 |
| 693.23509965 | 0 |
| 693.36040057 | 0 |
| 693.48571202 | 0 |
| 693.61103401 | 0.002 |
| 693.73636655 | 0 |
| 693.86170964 | 0.001 |
| 693.98706328 | 0 |
| 694.11242748 | 0.001 |
| 694.23780224 | 0 |
| 694.36318756 | 0.001 |
| 694.48858346 | 0 |
| 694.61398993 | 0.001 |
| 694.73940698 | 0 |
| 694.86483461 | 0.001 |
| 694.99027283 | 0 |
| 695.11572165 | 0.002 |
| 695.24118106 | 0 |
| 695.36665108 | 0.002 |
| 695.49213169 | 0 |
| 695.61762292 | 0.002 |
| 695.74312477 | 0 |
| 695.86863723 | 0.002 |
| 695.99416032 | 0 |
| 696.11969404 | 0.002 |
| 696.24523839 | 0 |
| 696.37079337 | 0.001 |
| 696.496359 | 0 |
| 696.62193527 | 0.001 |
| 696.74752219 | 0 |
| 696.87311977 | 0.001 |
| 696.99872801 | 0 |
| 697.12434691 | 0.001 |
| 697.24997648 | 0 |
| 697.37561672 | 0.002 |
| 697.50126764 | 0 |
| 697.62692923 | 0.002 |
| 697.75260152 | 0 |
| 697.87828449 | 0.002 |
| 698.00397816 | 0 |
| 698.12968253 | 0.001 |
| 698.2553976 | 0 |
| 698.38112338 | 0.002 |
| 698.50685987 | 0 |
| 698.63260708 | 0.002 |
| 698.75836501 | 0 |
| 698.88413366 | 0.001 |
| 699.00991305 | 0 |
| 699.13570317 | 0.001 |
| 699.26150402 | 0 |
| 699.38731562 | 0.001 |
| 699.51313797 | 0 |
| 699.63897107 | 0 |
| 699.7648149300001 | 0 |
| 699.89066955 | 0.001 |
| 700.01653493 | 0 |
| 700.14241108 | 0.002 |
| 700.26829801 | 0 |
| 700.39419572 | 0.002 |
| 700.5201042 | 0 |
| 700.64602348 | 0.002 |
| 700.77195355 | 0 |
| 700.89789441 | 0.001 |
| 701.02384608 | 0 |
| 701.14980855 | 0.002 |
| 701.27578183 | 0 |
| 701.40176592 | 0.001 |
| 701.52776084 | 0 |
| 701.65376657 | 0.001 |
| 701.77978313 | 0 |
| 701.90581053 | 0.001 |
| 702.03184876 | 0 |
| 702.15789783 | 0.001 |
| 702.28395774 | 0 |
| 702.41002851 | 0.001 |
| 702.53611013 | 0 |
| 702.66220261 | 0.002 |
| 702.78830595 | 0 |
| 702.91442015 | 0 |
| 703.04054523 | 0 |
| 703.16668119 | 0.001 |
| 703.29282802 | 0 |
| 703.41898574 | 0.001 |
| 703.54515435 | 0 |
| 703.67133386 | 0.001 |
| 703.79752426 | 0 |
| 703.92372556 | 0.001 |
| 704.04993777 | 0 |
| 704.1761609 | 0.001 |
| 704.30239493 | 0 |
| 704.42863989 | 0 |
| 704.55489577 | 0 |
| 704.68116259 | 0.002 |
| 704.80744033 | 0 |
| 704.93372902 | 0 |
| 705.06002864 | 0 |
| 705.18633921 | 0.002 |
| 705.31266074 | 0 |
| 705.43899322 | 0.002 |
| 705.56533666 | 0 |
| 705.69169106 | 0.001 |
| 705.81805644 | 0 |
| 705.94443278 | 0.002 |
| 706.07082011 | 0 |
| 706.19721841 | 0.002 |
| 706.32362771 | 0 |
| 706.45004799 | 0.001 |
| 706.57647927 | 0 |
| 706.70292155 | 0.001 |
| 706.82937483 | 0 |
| 706.95583913 | 0.002 |
| 707.08231443 | 0 |
| 707.20880076 | 0.001 |
| 707.3352981 | 0 |
| 707.46180648 | 0.001 |
| 707.58832588 | 0 |
| 707.71485632 | 0.001 |
| 707.8413978 | 0 |
| 707.96795032 | 0.001 |
| 708.09451389 | 0 |
| 708.22108851 | 0.002 |
| 708.34767419 | 0 |
| 708.47427094 | 0 |
| 708.60087875 | 0 |
| 708.72749763 | 0.001 |
| 708.85412758 | 0 |
| 708.98076862 | 0.001 |
| 709.10742074 | 0 |
| 709.23408395 | 0.001 |
| 709.36075825 | 0 |
| 709.48744364 | 0.001 |
| 709.61414014 | 0 |
| 709.74084775 | 0 |
| 709.86756647 | 0 |
| 709.9942963 | 0.001 |
| 710.12103725 | 0 |
| 710.24778932 | 0.001 |
| 710.37455253 | 0 |
| 710.50132686 | 0.002 |
| 710.62811233 | 0 |
| 710.75490895 | 0.001 |
| 710.88171671 | 0 |
| 711.00853562 | 0.001 |
| 711.13536569 | 0 |
| 711.26220691 | 0.003 |
| 711.3890593 | 0 |
| 711.51592286 | 0 |
| 711.64279759 | 0 |
| 711.76968349 | 0.002 |
| 711.89658058 | 0 |
| 712.02348885 | 0.001 |
| 712.15040832 | 0 |
| 712.27733897 | 0.001 |
| 712.40428083 | 0 |
| 712.53123389 | 0 |
| 712.65819816 | 0 |
| 712.78517364 | 0.001 |
| 712.91216034 | 0 |
| 713.03915826 | 0.002 |
| 713.16616741 | 0 |
| 713.29318778 | 0.001 |
| 713.42021939 | 0 |
| 713.54726224 | 0.002 |
| 713.67431633 | 0 |
| 713.80138167 | 0.001 |
| 713.92845826 | 0 |
| 714.05554611 | 0 |
| 714.18264522 | 0 |
| 714.3097556 | 0.002 |
| 714.43687724 | 0 |
| 714.56401016 | 0 |
| 714.69115436 | 0 |
| 714.81830984 | 0.001 |
| 714.94547661 | 0 |
| 715.07265467 | 0.001 |
| 715.19984403 | 0 |
| 715.32704469 | 0.002 |
| 715.45425665 | 0 |
| 715.58147993 | 0.002 |
| 715.70871451 | 0 |
| 715.83596042 | 0.001 |
| 715.96321765 | 0 |
| 716.09048621 | 0.001 |
| 716.2177661 | 0 |
| 716.34505732 | 0.001 |
| 716.47235989 | 0 |
| 716.5996738 | 0.001 |
| 716.72699906 | 0 |
| 716.85433567 | 0.001 |
| 716.98168365 | 0 |
| 717.10904298 | 0.002 |
| 717.23641369 | 0 |
| 717.36379576 | 0.002 |
| 717.49118921 | 0 |
| 717.61859404 | 0.001 |
| 717.74601026 | 0 |
| 717.87343787 | 0.001 |
| 718.00087687 | 0 |
| 718.12832727 | 0.001 |
| 718.25578907 | 0 |
| 718.38326227 | 0.001 |
| 718.51074689 | 0 |
| 718.63824293 | 0.001 |
| 718.76575039 | 0 |
| 718.89326927 | 0.001 |
| 719.02079958 | 0 |
| 719.14834132 | 0.001 |
| 719.2758945 | 0 |
| 719.40345913 | 0.002 |
| 719.5310352 | 0 |
| 719.65862272 | 0.001 |
| 719.7862217 | 0 |
| 719.91383214 | 0.001 |
| 720.04145405 | 0 |
| 720.16908742 | 0.001 |
| 720.29673226 | 0 |
| 720.42438859 | 0.002 |
| 720.5520564 | 0 |
| 720.67973569 | 0.001 |
| 720.80742647 | 0 |
| 720.93512875 | 0.001 |
| 721.06284254 | 0 |
| 721.19056782 | 0.001 |
| 721.31830461 | 0 |
| 721.44605292 | 0.001 |
| 721.57381275 | 0 |
| 721.70158409 | 0.001 |
| 721.82936697 | 0 |
| 721.95716137 | 0 |
| 722.08496731 | 0 |
| 722.2127848 | 0.001 |
| 722.34061382 | 0 |
| 722.46845439 | 0.002 |
| 722.59630652 | 0 |
| 722.72417021 | 0.001 |
| 722.85204545 | 0 |
| 722.97993227 | 0.002 |
| 723.10783065 | 0 |
| 723.23574061 | 0.001 |
| 723.36366215 | 0 |
| 723.49159527 | 0.002 |
| 723.61953998 | 0 |
| 723.74749629 | 0.001 |
| 723.87546419 | 0 |
| 724.00344369 | 0.001 |
| 724.13143481 | 0 |
| 724.25943753 | 0 |
| 724.38745186 | 0 |
| 724.51547782 | 0.001 |
| 724.6435154 | 0 |
| 724.77156461 | 0.001 |
| 724.89962545 | 0 |
| 725.02769793 | 0.002 |
| 725.15578205 | 0 |
| 725.28387782 | 0.001 |
| 725.41198523 | 0 |
| 725.54010431 | 0.001 |
| 725.66823504 | 0 |
| 725.79637743 | 0.001 |
| 725.9245315 | 0 |
| 726.05269723 | 0 |
| 726.18087465 | 0 |
| 726.30906374 | 0.002 |
| 726.43726452 | 0 |
| 726.565477 | 0.001 |
| 726.69370116 | 0 |
| 726.82193703 | 0.002 |
| 726.9501846 | 0 |
| 727.07844387 | 0.001 |
| 727.20671486 | 0 |
| 727.33499757 | 0.002 |
| 727.463292 | 0 |
| 727.59159815 | 0.002 |
| 727.71991604 | 0 |
| 727.84824566 | 0.002 |
| 727.97658702 | 0 |
| 728.10494012 | 0.002 |
| 728.23330497 | 0 |
| 728.36168157 | 0.001 |
| 728.49006993 | 0 |
| 728.61847005 | 0.001 |
| 728.74688194 | 0 |
| 728.87530559 | 0.001 |
| 729.00374102 | 0 |
| 729.13218823 | 0.002 |
| 729.26064723 | 0 |
| 729.38911801 | 0.002 |
| 729.51760058 | 0 |
| 729.64609495 | 0.001 |
| 729.77460112 | 0 |
| 729.9031191 | 0.001 |
| 730.03164888 | 0 |
| 730.16019048 | 0.001 |
| 730.2887439 | 0 |
| 730.41730914 | 0.001 |
| 730.54588621 | 0 |
| 730.67447512 | 0.001 |
| 730.80307586 | 0 |
| 730.93168843 | 0.001 |
| 731.06031286 | 0 |
| 731.18894913 | 0 |
| 731.31759726 | 0 |
| 731.44625725 | 0.001 |
| 731.5749291 | 0 |
| 731.70361282 | 0.001 |
| 731.83230841 | 0 |
| 731.96101587 | 0.001 |
| 732.08973522 | 0 |
| 732.21846645 | 0.001 |
| 732.34720958 | 0 |
| 732.47596459 | 0.001 |
| 732.60473151 | 0 |
| 732.73351032 | 0.001 |
| 732.86230105 | 0 |
| 732.99110368 | 0 |
| 733.11991823 | 0 |
| 733.24874471 | 0.001 |
| 733.37758311 | 0 |
| 733.50643343 | 0 |
| 733.63529569 | 0 |
| 733.76416989 | 0 |
| 733.89305604 | 0 |
| 734.02195412 | 0 |
| 734.15086417 | 0 |
| 734.27978616 | 0.002 |
| 734.40872012 | 0 |
| 734.53766604 | 0.001 |
| 734.66662393 | 0 |
| 734.7955938 | 0.001 |
| 734.92457564 | 0 |
| 735.05356947 | 0.001 |
| 735.18257528 | 0 |
| 735.31159308 | 0 |
| 735.44062288 | 0 |
| 735.56966468 | 0.002 |
| 735.69871849 | 0 |
| 735.8277843 | 0.001 |
| 735.95686213 | 0 |
| 736.08595197 | 0.001 |
| 736.21505384 | 0 |
| 736.34416774 | 0.001 |
| 736.47329366 | 0 |
| 736.60243162 | 0.001 |
| 736.73158163 | 0 |
| 736.86074367 | 0.001 |
| 736.98991777 | 0 |
| 737.11910392 | 0.001 |
| 737.24830212 | 0 |
| 737.37751239 | 0.001 |
| 737.50673473 | 0 |
| 737.63596913 | 0.001 |
| 737.76521561 | 0 |
| 737.89447418 | 0.001 |
| 738.02374482 | 0 |
| 738.15302756 | 0.001 |
| 738.28232238 | 0 |
| 738.41162931 | 0.001 |
| 738.54094834 | 0 |
| 738.67027947 | 0.002 |
| 738.79962272 | 0 |
| 738.92897808 | 0.003 |
| 739.05834556 | 0 |
| 739.18772516 | 0.002 |
| 739.31711689 | 0 |
| 739.44652076 | 0.001 |
| 739.57593676 | 0 |
| 739.70536491 | 0.001 |
| 739.8348052 | 0 |
| 739.96425764 | 0.002 |
| 740.09372224 | 0 |
| 740.223199 | 0.002 |
| 740.35268792 | 0 |
| 740.48218901 | 0.001 |
| 740.61170227 | 0 |
| 740.74122771 | 0.002 |
| 740.87076533 | 0 |
| 741.00031514 | 0.002 |
| 741.12987714 | 0 |
| 741.25945133 | 0.001 |
| 741.38903773 | 0 |
| 741.51863632 | 0 |
| 741.64824713 | 0 |
| 741.77787015 | 0.001 |
| 741.90750538 | 0 |
| 742.03715284 | 0.001 |
| 742.16681252 | 0 |
| 742.29648443 | 0.001 |
| 742.42616858 | 0 |
| 742.55586497 | 0.002 |
| 742.6855736 | 0 |
| 742.81529448 | 0.001 |
| 742.94502761 | 0 |
| 743.074773 | 0.002 |
| 743.20453064 | 0 |
| 743.33430056 | 0.002 |
| 743.46408275 | 0 |
| 743.59387721 | 0 |
| 743.72368395 | 0 |
| 743.85350297 | 0.001 |
| 743.98333428 | 0 |
| 744.11317788 | 0.001 |
| 744.24303378 | 0 |
| 744.37290199 | 0.002 |
| 744.50278249 | 0 |
| 744.63267531 | 0.001 |
| 744.76258044 | 0 |
| 744.89249789 | 0.001 |
| 745.02242767 | 0 |
| 745.15236977 | 0.002 |
| 745.2823242 | 0 |
| 745.41229097 | 0.001 |
| 745.54227008 | 0 |
| 745.67226154 | 0.001 |
| 745.80226535 | 0 |
| 745.93228151 | 0.002 |
| 746.06231003 | 0 |
| 746.19235091 | 0.001 |
| 746.32240417 | 0 |
| 746.45246979 | 0 |
| 746.58254779 | 0 |
| 746.71263817 | 0.001 |
| 746.84274094 | 0 |
| 746.97285609 | 0.001 |